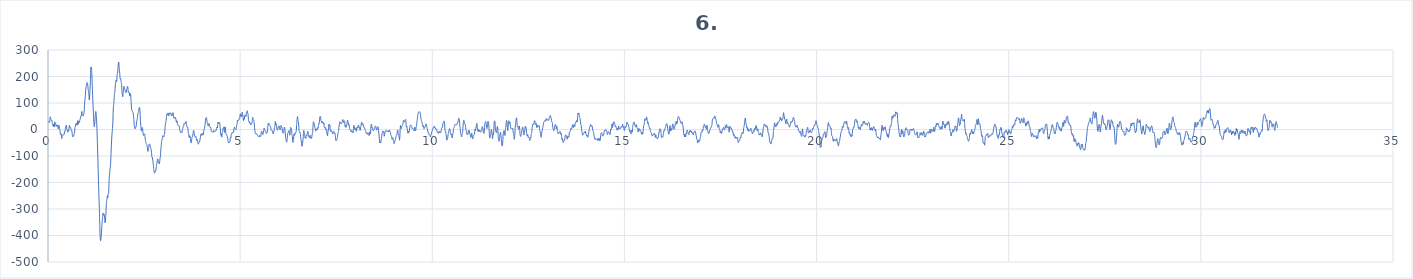
| Category | 6. kanál |
|---|---|
| 0.0 | 24.7 |
| 0.0078125 | 28.9 |
| 0.015625 | 31.4 |
| 0.0234375 | 27.4 |
| 0.03125 | 27.6 |
| 0.0390625 | 26.8 |
| 0.046875 | 31 |
| 0.0546875 | 44.9 |
| 0.0625 | 47.8 |
| 0.0703125 | 40.3 |
| 0.078125 | 37.4 |
| 0.0859375 | 34.8 |
| 0.09375 | 33.5 |
| 0.1015625 | 34.4 |
| 0.109375 | 26.9 |
| 0.1171875 | 18.6 |
| 0.125 | 17.2 |
| 0.1328125 | 12.1 |
| 0.140625 | 12.3 |
| 0.1484375 | 20.6 |
| 0.15625 | 14.6 |
| 0.1640625 | 9.6 |
| 0.171875 | 24.5 |
| 0.1796875 | 29 |
| 0.1875 | 21.6 |
| 0.1953125 | 23 |
| 0.203125 | 18.4 |
| 0.2109375 | 12.3 |
| 0.21875 | 17.4 |
| 0.2265625 | 16 |
| 0.234375 | 12 |
| 0.2421875 | 16.7 |
| 0.25 | 15.9 |
| 0.2578125 | 7.8 |
| 0.265625 | 2.4 |
| 0.2734375 | 6.6 |
| 0.28125 | 15.7 |
| 0.2890625 | 13.8 |
| 0.296875 | 5.8 |
| 0.3046875 | 2 |
| 0.3125 | -5.3 |
| 0.3203125 | -15.6 |
| 0.328125 | -20.4 |
| 0.3359375 | -17.6 |
| 0.34375 | -16.3 |
| 0.3515625 | -27.1 |
| 0.359375 | -33.7 |
| 0.3671875 | -26 |
| 0.375 | -21.8 |
| 0.3828125 | -21.9 |
| 0.390625 | -20.1 |
| 0.3984375 | -20.5 |
| 0.40625 | -19.9 |
| 0.4140625 | -20.1 |
| 0.421875 | -18.5 |
| 0.4296875 | -9 |
| 0.4375 | -6.4 |
| 0.4453125 | -7.1 |
| 0.453125 | 4.2 |
| 0.4609375 | 11.5 |
| 0.46875 | 12.5 |
| 0.4765625 | 16.5 |
| 0.484375 | 9.8 |
| 0.4921875 | -0.5 |
| 0.5 | -0.7 |
| 0.5078125 | -5.7 |
| 0.515625 | -10.5 |
| 0.5234375 | -3.7 |
| 0.53125 | -3.2 |
| 0.5390625 | -5.9 |
| 0.546875 | 5.3 |
| 0.5546875 | 15.7 |
| 0.5625 | 14.8 |
| 0.5703125 | 10.9 |
| 0.578125 | 7 |
| 0.5859375 | 6.7 |
| 0.59375 | 6.8 |
| 0.6015625 | -0.3 |
| 0.609375 | -5.4 |
| 0.6171875 | -4.6 |
| 0.625 | -9.1 |
| 0.6328125 | -19.4 |
| 0.640625 | -26.6 |
| 0.6484375 | -26.3 |
| 0.65625 | -24.3 |
| 0.6640625 | -25.9 |
| 0.671875 | -21.9 |
| 0.6796875 | -15.2 |
| 0.6875 | -14.1 |
| 0.6953125 | -4.9 |
| 0.703125 | 8.3 |
| 0.7109375 | 11.1 |
| 0.71875 | 16.6 |
| 0.7265625 | 22.5 |
| 0.734375 | 20 |
| 0.7421875 | 23.3 |
| 0.75 | 23.9 |
| 0.7578125 | 15.4 |
| 0.765625 | 22.3 |
| 0.7734375 | 33.6 |
| 0.78125 | 25.6 |
| 0.7890625 | 19.9 |
| 0.796875 | 28.8 |
| 0.8046875 | 31.7 |
| 0.8125 | 26.7 |
| 0.8203125 | 29.5 |
| 0.828125 | 36.5 |
| 0.8359375 | 38.7 |
| 0.84375 | 43.3 |
| 0.8515625 | 49.1 |
| 0.859375 | 48.6 |
| 0.8671875 | 53.1 |
| 0.875 | 65.6 |
| 0.8828125 | 67.6 |
| 0.890625 | 57.3 |
| 0.8984375 | 51.7 |
| 0.90625 | 52.4 |
| 0.9140625 | 51.3 |
| 0.921875 | 52.2 |
| 0.9296875 | 57.1 |
| 0.9375 | 62.9 |
| 0.9453125 | 78.7 |
| 0.953125 | 100.9 |
| 0.9609375 | 112.1 |
| 0.96875 | 120.2 |
| 0.9765625 | 137.4 |
| 0.984375 | 153.1 |
| 0.9921875 | 160.9 |
| 1.0 | 165.9 |
| 1.0078125 | 172 |
| 1.015625 | 177 |
| 1.0234375 | 176.1 |
| 1.03125 | 171.1 |
| 1.0390625 | 161.8 |
| 1.046875 | 149.6 |
| 1.0546875 | 143.8 |
| 1.0625 | 134.4 |
| 1.0703125 | 114.8 |
| 1.078125 | 111 |
| 1.0859375 | 129.7 |
| 1.09375 | 151.9 |
| 1.1015625 | 179.8 |
| 1.109375 | 215 |
| 1.1171875 | 236.2 |
| 1.125 | 235.4 |
| 1.1328125 | 226.7 |
| 1.140625 | 212 |
| 1.1484375 | 182.4 |
| 1.15625 | 147.2 |
| 1.1640625 | 119.2 |
| 1.171875 | 93.1 |
| 1.1796875 | 66.1 |
| 1.1875 | 42.6 |
| 1.1953125 | 21.9 |
| 1.203125 | 10.5 |
| 1.2109375 | 15 |
| 1.21875 | 28.4 |
| 1.2265625 | 44.6 |
| 1.234375 | 60.3 |
| 1.2421875 | 68.1 |
| 1.25 | 63.6 |
| 1.2578125 | 50.3 |
| 1.265625 | 31.6 |
| 1.2734375 | 3.4 |
| 1.28125 | -32.3 |
| 1.2890625 | -66.6 |
| 1.296875 | -104.2 |
| 1.3046875 | -148.6 |
| 1.3125 | -191.3 |
| 1.3203125 | -231.2 |
| 1.328125 | -266 |
| 1.3359375 | -297.1 |
| 1.34375 | -339.7 |
| 1.3515625 | -386.7 |
| 1.359375 | -412.9 |
| 1.3671875 | -419.6 |
| 1.375 | -417.6 |
| 1.3828125 | -406.4 |
| 1.390625 | -390.3 |
| 1.3984375 | -372.5 |
| 1.40625 | -354 |
| 1.4140625 | -342.4 |
| 1.421875 | -331.1 |
| 1.4296875 | -316.3 |
| 1.4375 | -316.2 |
| 1.4453125 | -323.5 |
| 1.453125 | -319.9 |
| 1.4609375 | -318.5 |
| 1.46875 | -325.4 |
| 1.4765625 | -337.2 |
| 1.484375 | -352.2 |
| 1.4921875 | -348.6 |
| 1.5 | -330.7 |
| 1.5078125 | -317.2 |
| 1.515625 | -292.4 |
| 1.5234375 | -270.4 |
| 1.53125 | -267.2 |
| 1.5390625 | -255.7 |
| 1.546875 | -249.7 |
| 1.5546875 | -258.1 |
| 1.5625 | -249.2 |
| 1.5703125 | -241.9 |
| 1.578125 | -241.7 |
| 1.5859375 | -213.2 |
| 1.59375 | -181.3 |
| 1.6015625 | -170.2 |
| 1.609375 | -157.3 |
| 1.6171875 | -144.7 |
| 1.625 | -137.2 |
| 1.6328125 | -119.3 |
| 1.640625 | -91.2 |
| 1.6484375 | -63.1 |
| 1.65625 | -39.6 |
| 1.6640625 | -19.7 |
| 1.671875 | -5.6 |
| 1.6796875 | 3.7 |
| 1.6875 | 27.7 |
| 1.6953125 | 64.9 |
| 1.703125 | 86.3 |
| 1.7109375 | 93.9 |
| 1.71875 | 110.9 |
| 1.7265625 | 130 |
| 1.734375 | 137.1 |
| 1.7421875 | 146.2 |
| 1.75 | 164.3 |
| 1.7578125 | 175.1 |
| 1.765625 | 180.9 |
| 1.7734375 | 186.3 |
| 1.78125 | 180.2 |
| 1.7890625 | 182.3 |
| 1.796875 | 203.5 |
| 1.8046875 | 212.1 |
| 1.8125 | 213.3 |
| 1.8203125 | 228.1 |
| 1.828125 | 243.6 |
| 1.8359375 | 254.6 |
| 1.84375 | 252.6 |
| 1.8515625 | 233.5 |
| 1.859375 | 221.8 |
| 1.8671875 | 211.4 |
| 1.875 | 192.4 |
| 1.8828125 | 189.8 |
| 1.890625 | 192.7 |
| 1.8984375 | 183.1 |
| 1.90625 | 177.4 |
| 1.9140625 | 169.1 |
| 1.921875 | 150.6 |
| 1.9296875 | 136.9 |
| 1.9375 | 127.3 |
| 1.9453125 | 123.5 |
| 1.953125 | 135 |
| 1.9609375 | 149.1 |
| 1.96875 | 157.6 |
| 1.9765625 | 162.8 |
| 1.984375 | 159.8 |
| 1.9921875 | 153.5 |
| 2.0 | 151.6 |
| 2.0078125 | 146.5 |
| 2.015625 | 140.3 |
| 2.0234375 | 139.5 |
| 2.03125 | 138.3 |
| 2.0390625 | 140.4 |
| 2.046875 | 149.9 |
| 2.0546875 | 156.2 |
| 2.0625 | 159.6 |
| 2.0703125 | 163.3 |
| 2.078125 | 158.4 |
| 2.0859375 | 147.4 |
| 2.09375 | 140.1 |
| 2.1015625 | 138.5 |
| 2.109375 | 140.8 |
| 2.1171875 | 138.9 |
| 2.125 | 129.4 |
| 2.1328125 | 126.3 |
| 2.140625 | 134.3 |
| 2.1484375 | 135 |
| 2.15625 | 119.9 |
| 2.1640625 | 101.2 |
| 2.171875 | 84.5 |
| 2.1796875 | 72.6 |
| 2.1875 | 70.4 |
| 2.1953125 | 69.9 |
| 2.203125 | 66.4 |
| 2.2109375 | 64.7 |
| 2.21875 | 58.8 |
| 2.2265625 | 48.4 |
| 2.234375 | 38.6 |
| 2.2421875 | 23 |
| 2.25 | 8.8 |
| 2.2578125 | 4.9 |
| 2.265625 | 2.7 |
| 2.2734375 | 3.9 |
| 2.28125 | 8.9 |
| 2.2890625 | 8.9 |
| 2.296875 | 14.4 |
| 2.3046875 | 27.8 |
| 2.3125 | 34 |
| 2.3203125 | 37.3 |
| 2.328125 | 46.1 |
| 2.3359375 | 55 |
| 2.34375 | 61.2 |
| 2.3515625 | 64.1 |
| 2.359375 | 68.5 |
| 2.3671875 | 78.6 |
| 2.375 | 83.8 |
| 2.3828125 | 82.3 |
| 2.390625 | 77.8 |
| 2.3984375 | 58 |
| 2.40625 | 29.7 |
| 2.4140625 | 14.9 |
| 2.421875 | 4.8 |
| 2.4296875 | -6.1 |
| 2.4375 | -3.2 |
| 2.4453125 | 6 |
| 2.453125 | 7.7 |
| 2.4609375 | 3.3 |
| 2.46875 | -7 |
| 2.4765625 | -18.2 |
| 2.484375 | -22.7 |
| 2.4921875 | -21.4 |
| 2.5 | -17.5 |
| 2.5078125 | -16.4 |
| 2.515625 | -19.8 |
| 2.5234375 | -26.3 |
| 2.53125 | -37.6 |
| 2.5390625 | -45.7 |
| 2.546875 | -48.3 |
| 2.5546875 | -52.9 |
| 2.5625 | -55.3 |
| 2.5703125 | -56.4 |
| 2.578125 | -61.9 |
| 2.5859375 | -68.9 |
| 2.59375 | -77.5 |
| 2.6015625 | -82.8 |
| 2.609375 | -79.3 |
| 2.6171875 | -72.3 |
| 2.625 | -62.4 |
| 2.6328125 | -55.2 |
| 2.640625 | -55.4 |
| 2.6484375 | -55.2 |
| 2.65625 | -59 |
| 2.6640625 | -65.8 |
| 2.671875 | -67.5 |
| 2.6796875 | -72.6 |
| 2.6875 | -81.1 |
| 2.6953125 | -90.7 |
| 2.703125 | -104 |
| 2.7109375 | -106.3 |
| 2.71875 | -105.6 |
| 2.7265625 | -117.9 |
| 2.734375 | -126.2 |
| 2.7421875 | -132.6 |
| 2.75 | -147 |
| 2.7578125 | -155.6 |
| 2.765625 | -161.1 |
| 2.7734375 | -164.7 |
| 2.78125 | -158.6 |
| 2.7890625 | -157.4 |
| 2.796875 | -159.8 |
| 2.8046875 | -154 |
| 2.8125 | -148.3 |
| 2.8203125 | -141.2 |
| 2.828125 | -130.9 |
| 2.8359375 | -125 |
| 2.84375 | -117.5 |
| 2.8515625 | -111 |
| 2.859375 | -113 |
| 2.8671875 | -119.2 |
| 2.875 | -125.7 |
| 2.8828125 | -126.7 |
| 2.890625 | -125.9 |
| 2.8984375 | -129.4 |
| 2.90625 | -122.2 |
| 2.9140625 | -109.8 |
| 2.921875 | -104.4 |
| 2.9296875 | -89.8 |
| 2.9375 | -72.1 |
| 2.9453125 | -63.4 |
| 2.953125 | -50.2 |
| 2.9609375 | -40.9 |
| 2.96875 | -39.4 |
| 2.9765625 | -30.1 |
| 2.984375 | -23.4 |
| 2.9921875 | -25 |
| 3.0 | -26.1 |
| 3.0078125 | -28.8 |
| 3.015625 | -26.4 |
| 3.0234375 | -20.2 |
| 3.03125 | -17.7 |
| 3.0390625 | -7.2 |
| 3.046875 | 8.4 |
| 3.0546875 | 17.8 |
| 3.0625 | 25.5 |
| 3.0703125 | 30.5 |
| 3.078125 | 39.7 |
| 3.0859375 | 55.8 |
| 3.09375 | 58.5 |
| 3.1015625 | 53.9 |
| 3.109375 | 58 |
| 3.1171875 | 61.3 |
| 3.125 | 62.8 |
| 3.1328125 | 60.6 |
| 3.140625 | 51.8 |
| 3.1484375 | 53.8 |
| 3.15625 | 61.1 |
| 3.1640625 | 60.2 |
| 3.171875 | 62.3 |
| 3.1796875 | 63.1 |
| 3.1875 | 59.4 |
| 3.1953125 | 62.1 |
| 3.203125 | 59.4 |
| 3.2109375 | 51.1 |
| 3.21875 | 53.2 |
| 3.2265625 | 55.1 |
| 3.234375 | 53.1 |
| 3.2421875 | 58.1 |
| 3.25 | 63.6 |
| 3.2578125 | 61.2 |
| 3.265625 | 52.2 |
| 3.2734375 | 43.7 |
| 3.28125 | 43.3 |
| 3.2890625 | 43.7 |
| 3.296875 | 41.6 |
| 3.3046875 | 44.1 |
| 3.3125 | 46.3 |
| 3.3203125 | 43.7 |
| 3.328125 | 38.7 |
| 3.3359375 | 30.5 |
| 3.34375 | 27.2 |
| 3.3515625 | 32.9 |
| 3.359375 | 32.1 |
| 3.3671875 | 22.1 |
| 3.375 | 16.9 |
| 3.3828125 | 17 |
| 3.390625 | 15.4 |
| 3.3984375 | 14.2 |
| 3.40625 | 15 |
| 3.4140625 | 12.8 |
| 3.421875 | 4.7 |
| 3.4296875 | -3.3 |
| 3.4375 | -6.9 |
| 3.4453125 | -9.8 |
| 3.453125 | -11.7 |
| 3.4609375 | -9.7 |
| 3.46875 | -8.4 |
| 3.4765625 | -11.3 |
| 3.484375 | -11.5 |
| 3.4921875 | -5.3 |
| 3.5 | 0.6 |
| 3.5078125 | 4 |
| 3.515625 | 9 |
| 3.5234375 | 12 |
| 3.53125 | 13.6 |
| 3.5390625 | 20.3 |
| 3.546875 | 24.6 |
| 3.5546875 | 22.4 |
| 3.5625 | 23 |
| 3.5703125 | 23.5 |
| 3.578125 | 22.6 |
| 3.5859375 | 28.5 |
| 3.59375 | 30.3 |
| 3.6015625 | 21.3 |
| 3.609375 | 15.2 |
| 3.6171875 | 11.2 |
| 3.625 | 6.8 |
| 3.6328125 | 8.2 |
| 3.640625 | 4.1 |
| 3.6484375 | -9.1 |
| 3.65625 | -15.7 |
| 3.6640625 | -19.9 |
| 3.671875 | -29.3 |
| 3.6796875 | -30.9 |
| 3.6875 | -24.6 |
| 3.6953125 | -23.5 |
| 3.703125 | -29.5 |
| 3.7109375 | -39.4 |
| 3.71875 | -48.8 |
| 3.7265625 | -50.8 |
| 3.734375 | -44.2 |
| 3.7421875 | -34.7 |
| 3.75 | -29.3 |
| 3.7578125 | -28.2 |
| 3.765625 | -24.7 |
| 3.7734375 | -16.2 |
| 3.78125 | -6.9 |
| 3.7890625 | -2.9 |
| 3.796875 | -6.9 |
| 3.8046875 | -14.2 |
| 3.8125 | -20.7 |
| 3.8203125 | -25.5 |
| 3.828125 | -28.1 |
| 3.8359375 | -29.3 |
| 3.84375 | -27.7 |
| 3.8515625 | -26.7 |
| 3.859375 | -34.6 |
| 3.8671875 | -41.6 |
| 3.875 | -37.2 |
| 3.8828125 | -36.7 |
| 3.890625 | -45.8 |
| 3.8984375 | -50 |
| 3.90625 | -51.5 |
| 3.9140625 | -55.5 |
| 3.921875 | -52 |
| 3.9296875 | -45.1 |
| 3.9375 | -46 |
| 3.9453125 | -46.5 |
| 3.953125 | -40.1 |
| 3.9609375 | -32.6 |
| 3.96875 | -25.9 |
| 3.9765625 | -19.1 |
| 3.984375 | -16.7 |
| 3.9921875 | -21.1 |
| 4.0 | -22.2 |
| 4.0078125 | -15.3 |
| 4.015625 | -14.3 |
| 4.0234375 | -19.8 |
| 4.03125 | -20.5 |
| 4.0390625 | -20.5 |
| 4.046875 | -17.2 |
| 4.0546875 | -4.8 |
| 4.0625 | 1.9 |
| 4.0703125 | 2.2 |
| 4.078125 | 9.5 |
| 4.0859375 | 18.5 |
| 4.09375 | 28.2 |
| 4.1015625 | 40.3 |
| 4.109375 | 43.9 |
| 4.1171875 | 44 |
| 4.125 | 44.6 |
| 4.1328125 | 36.2 |
| 4.140625 | 26.7 |
| 4.1484375 | 22.3 |
| 4.15625 | 16.1 |
| 4.1640625 | 13.2 |
| 4.171875 | 13.9 |
| 4.1796875 | 16.9 |
| 4.1875 | 23.1 |
| 4.1953125 | 19.6 |
| 4.203125 | 10.7 |
| 4.2109375 | 10.1 |
| 4.21875 | 8.7 |
| 4.2265625 | 7.3 |
| 4.234375 | 8.8 |
| 4.2421875 | 0.7 |
| 4.25 | -7.8 |
| 4.2578125 | -6.8 |
| 4.265625 | -8 |
| 4.2734375 | -10.2 |
| 4.28125 | -9.2 |
| 4.2890625 | -10.5 |
| 4.296875 | -10.4 |
| 4.3046875 | -5.7 |
| 4.3125 | -2.5 |
| 4.3203125 | -4.8 |
| 4.328125 | -7.8 |
| 4.3359375 | -7.7 |
| 4.34375 | -6.5 |
| 4.3515625 | -5.3 |
| 4.359375 | -6.1 |
| 4.3671875 | -6.5 |
| 4.375 | -2 |
| 4.3828125 | 3.1 |
| 4.390625 | 8 |
| 4.3984375 | 8.9 |
| 4.40625 | 5.5 |
| 4.4140625 | 15.2 |
| 4.421875 | 27.9 |
| 4.4296875 | 23.9 |
| 4.4375 | 23 |
| 4.4453125 | 28.2 |
| 4.453125 | 26.7 |
| 4.4609375 | 27.5 |
| 4.46875 | 23.2 |
| 4.4765625 | 11.6 |
| 4.484375 | 2.7 |
| 4.4921875 | -13.1 |
| 4.5 | -21.9 |
| 4.5078125 | -16.4 |
| 4.515625 | -24.3 |
| 4.5234375 | -28.8 |
| 4.53125 | -14.2 |
| 4.5390625 | -10.1 |
| 4.546875 | -8.1 |
| 4.5546875 | 4 |
| 4.5625 | 5.1 |
| 4.5703125 | 4.3 |
| 4.578125 | 9.9 |
| 4.5859375 | 2.4 |
| 4.59375 | -11 |
| 4.6015625 | -5.4 |
| 4.609375 | 10.1 |
| 4.6171875 | 5.8 |
| 4.625 | -12.4 |
| 4.6328125 | -18.5 |
| 4.640625 | -19 |
| 4.6484375 | -22.1 |
| 4.65625 | -22.4 |
| 4.6640625 | -26.8 |
| 4.671875 | -32.3 |
| 4.6796875 | -36.1 |
| 4.6875 | -46 |
| 4.6953125 | -49.8 |
| 4.703125 | -47.2 |
| 4.7109375 | -50.5 |
| 4.71875 | -49.3 |
| 4.7265625 | -46.6 |
| 4.734375 | -45.2 |
| 4.7421875 | -34.1 |
| 4.75 | -29.3 |
| 4.7578125 | -32.4 |
| 4.765625 | -23.1 |
| 4.7734375 | -16 |
| 4.78125 | -17.6 |
| 4.7890625 | -12.9 |
| 4.796875 | -10.6 |
| 4.8046875 | -12.7 |
| 4.8125 | -10.8 |
| 4.8203125 | -11.1 |
| 4.828125 | -9.6 |
| 4.8359375 | -0.4 |
| 4.84375 | 7.2 |
| 4.8515625 | 8.9 |
| 4.859375 | 6.9 |
| 4.8671875 | 2.9 |
| 4.875 | 0.3 |
| 4.8828125 | -0.9 |
| 4.890625 | -1.2 |
| 4.8984375 | 4.1 |
| 4.90625 | 12.9 |
| 4.9140625 | 16.9 |
| 4.921875 | 22.2 |
| 4.9296875 | 33 |
| 4.9375 | 35.8 |
| 4.9453125 | 33.2 |
| 4.953125 | 36.1 |
| 4.9609375 | 36 |
| 4.96875 | 36.2 |
| 4.9765625 | 42.3 |
| 4.984375 | 41.2 |
| 4.9921875 | 43.2 |
| 5.0 | 57.8 |
| 5.0078125 | 59.3 |
| 5.015625 | 50.2 |
| 5.0234375 | 52.8 |
| 5.03125 | 51.9 |
| 5.0390625 | 48.5 |
| 5.046875 | 60.1 |
| 5.0546875 | 65.5 |
| 5.0625 | 58.6 |
| 5.0703125 | 54.6 |
| 5.078125 | 42.4 |
| 5.0859375 | 33.4 |
| 5.09375 | 41 |
| 5.1015625 | 39.6 |
| 5.109375 | 38.2 |
| 5.1171875 | 51.7 |
| 5.125 | 55 |
| 5.1328125 | 52.2 |
| 5.140625 | 53.2 |
| 5.1484375 | 49.1 |
| 5.15625 | 54.9 |
| 5.1640625 | 64.2 |
| 5.171875 | 62.4 |
| 5.1796875 | 67.7 |
| 5.1875 | 70.7 |
| 5.1953125 | 62.1 |
| 5.203125 | 58.8 |
| 5.2109375 | 47.6 |
| 5.21875 | 30.9 |
| 5.2265625 | 31.7 |
| 5.234375 | 31.1 |
| 5.2421875 | 25.4 |
| 5.25 | 27.8 |
| 5.2578125 | 24.1 |
| 5.265625 | 19.2 |
| 5.2734375 | 22.5 |
| 5.28125 | 20.7 |
| 5.2890625 | 19.2 |
| 5.296875 | 23 |
| 5.3046875 | 23.7 |
| 5.3125 | 31 |
| 5.3203125 | 44.3 |
| 5.328125 | 45.3 |
| 5.3359375 | 38.7 |
| 5.34375 | 37.2 |
| 5.3515625 | 36.4 |
| 5.359375 | 30.5 |
| 5.3671875 | 19.8 |
| 5.375 | 7.3 |
| 5.3828125 | -3.5 |
| 5.390625 | -11.8 |
| 5.3984375 | -15.6 |
| 5.40625 | -13.5 |
| 5.4140625 | -13.5 |
| 5.421875 | -17.1 |
| 5.4296875 | -17.1 |
| 5.4375 | -16.7 |
| 5.4453125 | -19.5 |
| 5.453125 | -21.5 |
| 5.4609375 | -23.9 |
| 5.46875 | -25.6 |
| 5.4765625 | -24.7 |
| 5.484375 | -26.5 |
| 5.4921875 | -28.7 |
| 5.5 | -25.8 |
| 5.5078125 | -21.9 |
| 5.515625 | -22.8 |
| 5.5234375 | -26.1 |
| 5.53125 | -26.7 |
| 5.5390625 | -22.5 |
| 5.546875 | -13.7 |
| 5.5546875 | -6.6 |
| 5.5625 | -7.2 |
| 5.5703125 | -10 |
| 5.578125 | -13.1 |
| 5.5859375 | -18.8 |
| 5.59375 | -19.3 |
| 5.6015625 | -15 |
| 5.609375 | -9.9 |
| 5.6171875 | -0.2 |
| 5.625 | 5.4 |
| 5.6328125 | 1.5 |
| 5.640625 | 0 |
| 5.6484375 | -1 |
| 5.65625 | -5.3 |
| 5.6640625 | -7 |
| 5.671875 | -10.3 |
| 5.6796875 | -14.7 |
| 5.6875 | -12.8 |
| 5.6953125 | -10.7 |
| 5.703125 | -11.9 |
| 5.7109375 | -7 |
| 5.71875 | 6.9 |
| 5.7265625 | 20.9 |
| 5.734375 | 23.6 |
| 5.7421875 | 18.9 |
| 5.75 | 19.6 |
| 5.7578125 | 21.6 |
| 5.765625 | 17.5 |
| 5.7734375 | 14.7 |
| 5.78125 | 14 |
| 5.7890625 | 11 |
| 5.796875 | 6.9 |
| 5.8046875 | 0.8 |
| 5.8125 | -2.8 |
| 5.8203125 | -1.5 |
| 5.828125 | -4.4 |
| 5.8359375 | -6.9 |
| 5.84375 | -6.6 |
| 5.8515625 | -14 |
| 5.859375 | -16.6 |
| 5.8671875 | -9.5 |
| 5.875 | -9.6 |
| 5.8828125 | -5.3 |
| 5.890625 | 6.7 |
| 5.8984375 | 7.9 |
| 5.90625 | 15.4 |
| 5.9140625 | 30.3 |
| 5.921875 | 24.2 |
| 5.9296875 | 16.6 |
| 5.9375 | 21.9 |
| 5.9453125 | 14.3 |
| 5.953125 | 1.2 |
| 5.9609375 | -0.5 |
| 5.96875 | -2 |
| 5.9765625 | -2.3 |
| 5.984375 | 5.4 |
| 5.9921875 | 11.4 |
| 6.0 | 11.8 |
| 6.0078125 | 13.3 |
| 6.015625 | 12.8 |
| 6.0234375 | 5 |
| 6.03125 | 0.9 |
| 6.0390625 | 1.5 |
| 6.046875 | -1.6 |
| 6.0546875 | 3.8 |
| 6.0625 | 15.4 |
| 6.0703125 | 13.9 |
| 6.078125 | 9.7 |
| 6.0859375 | 9.4 |
| 6.09375 | 2.9 |
| 6.1015625 | -5.5 |
| 6.109375 | -11.8 |
| 6.1171875 | -14.2 |
| 6.125 | -11.7 |
| 6.1328125 | -9.6 |
| 6.140625 | -1.7 |
| 6.1484375 | 8.7 |
| 6.15625 | 7.5 |
| 6.1640625 | 1.1 |
| 6.171875 | -8.9 |
| 6.1796875 | -25 |
| 6.1875 | -34.2 |
| 6.1953125 | -38.9 |
| 6.203125 | -45.9 |
| 6.2109375 | -47.5 |
| 6.21875 | -42.9 |
| 6.2265625 | -31.4 |
| 6.234375 | -17.6 |
| 6.2421875 | -13.4 |
| 6.25 | -11.4 |
| 6.2578125 | -5.5 |
| 6.265625 | -4.8 |
| 6.2734375 | -7.5 |
| 6.28125 | -13 |
| 6.2890625 | -21.8 |
| 6.296875 | -18.1 |
| 6.3046875 | -1 |
| 6.3125 | 8 |
| 6.3203125 | 6 |
| 6.328125 | 5.6 |
| 6.3359375 | 0.3 |
| 6.34375 | -14.5 |
| 6.3515625 | -23 |
| 6.359375 | -28.7 |
| 6.3671875 | -43 |
| 6.375 | -48.6 |
| 6.3828125 | -41 |
| 6.390625 | -32.1 |
| 6.3984375 | -20.3 |
| 6.40625 | -17.1 |
| 6.4140625 | -22.5 |
| 6.421875 | -16.8 |
| 6.4296875 | -13.1 |
| 6.4375 | -16.6 |
| 6.4453125 | -12.3 |
| 6.453125 | -10 |
| 6.4609375 | -4.4 |
| 6.46875 | 15.9 |
| 6.4765625 | 30.5 |
| 6.484375 | 39.2 |
| 6.4921875 | 49 |
| 6.5 | 42.8 |
| 6.5078125 | 31.4 |
| 6.515625 | 29.4 |
| 6.5234375 | 17.6 |
| 6.53125 | -1.4 |
| 6.5390625 | -8 |
| 6.546875 | -10.6 |
| 6.5546875 | -13 |
| 6.5625 | -12 |
| 6.5703125 | -20.5 |
| 6.578125 | -33.9 |
| 6.5859375 | -39.4 |
| 6.59375 | -47.7 |
| 6.6015625 | -58.5 |
| 6.609375 | -63.2 |
| 6.6171875 | -61.7 |
| 6.625 | -51.5 |
| 6.6328125 | -42 |
| 6.640625 | -31.5 |
| 6.6484375 | -10.8 |
| 6.65625 | -3.9 |
| 6.6640625 | -11 |
| 6.671875 | -11.6 |
| 6.6796875 | -20.1 |
| 6.6875 | -31.5 |
| 6.6953125 | -30.9 |
| 6.703125 | -33.9 |
| 6.7109375 | -33.1 |
| 6.71875 | -22.6 |
| 6.7265625 | -22.3 |
| 6.734375 | -23.8 |
| 6.7421875 | -17.6 |
| 6.75 | -12.5 |
| 6.7578125 | -7.4 |
| 6.765625 | -8.5 |
| 6.7734375 | -20 |
| 6.78125 | -26.5 |
| 6.7890625 | -26.5 |
| 6.796875 | -29.7 |
| 6.8046875 | -30.7 |
| 6.8125 | -25.1 |
| 6.8203125 | -21.6 |
| 6.828125 | -27.6 |
| 6.8359375 | -33.4 |
| 6.84375 | -29.4 |
| 6.8515625 | -28.2 |
| 6.859375 | -32.9 |
| 6.8671875 | -26 |
| 6.875 | -15.9 |
| 6.8828125 | -14.8 |
| 6.890625 | -4.4 |
| 6.8984375 | 17 |
| 6.90625 | 28.9 |
| 6.9140625 | 28 |
| 6.921875 | 23.5 |
| 6.9296875 | 21.5 |
| 6.9375 | 17.1 |
| 6.9453125 | 8.5 |
| 6.953125 | 3.8 |
| 6.9609375 | -2.2 |
| 6.96875 | -6.3 |
| 6.9765625 | 0.2 |
| 6.984375 | 1.2 |
| 6.9921875 | -0.8 |
| 7.0 | 3.7 |
| 7.0078125 | 0.4 |
| 7.015625 | 0.5 |
| 7.0234375 | 8.3 |
| 7.03125 | 6.2 |
| 7.0390625 | 11.9 |
| 7.046875 | 24.1 |
| 7.0546875 | 22.5 |
| 7.0625 | 29.1 |
| 7.0703125 | 43.8 |
| 7.078125 | 47.5 |
| 7.0859375 | 50.4 |
| 7.09375 | 46.1 |
| 7.1015625 | 34.8 |
| 7.109375 | 31.9 |
| 7.1171875 | 27.2 |
| 7.125 | 25 |
| 7.1328125 | 29.9 |
| 7.140625 | 26 |
| 7.1484375 | 25.8 |
| 7.15625 | 28.4 |
| 7.1640625 | 21.2 |
| 7.171875 | 23.9 |
| 7.1796875 | 24.8 |
| 7.1875 | 10.4 |
| 7.1953125 | 8.1 |
| 7.203125 | 9.5 |
| 7.2109375 | 4.5 |
| 7.21875 | 6.8 |
| 7.2265625 | 3.1 |
| 7.234375 | -1.8 |
| 7.2421875 | 0.2 |
| 7.25 | -9.2 |
| 7.2578125 | -16.1 |
| 7.265625 | -17.1 |
| 7.2734375 | -23.8 |
| 7.28125 | -13.7 |
| 7.2890625 | -0.9 |
| 7.296875 | -2.8 |
| 7.3046875 | 9.8 |
| 7.3125 | 20.3 |
| 7.3203125 | 13 |
| 7.328125 | 17.2 |
| 7.3359375 | 16 |
| 7.34375 | -1.9 |
| 7.3515625 | -6.7 |
| 7.359375 | -4.7 |
| 7.3671875 | -6.5 |
| 7.375 | -4 |
| 7.3828125 | -6.1 |
| 7.390625 | -9.9 |
| 7.3984375 | -10.5 |
| 7.40625 | -16.3 |
| 7.4140625 | -16.5 |
| 7.421875 | -8.5 |
| 7.4296875 | -7.7 |
| 7.4375 | -9 |
| 7.4453125 | -8.2 |
| 7.453125 | -12.6 |
| 7.4609375 | -15.4 |
| 7.46875 | -14.6 |
| 7.4765625 | -23.4 |
| 7.484375 | -37.8 |
| 7.4921875 | -41.3 |
| 7.5 | -38.8 |
| 7.5078125 | -40.8 |
| 7.515625 | -39.8 |
| 7.5234375 | -34.2 |
| 7.53125 | -29.8 |
| 7.5390625 | -20.9 |
| 7.546875 | -11.5 |
| 7.5546875 | -10.4 |
| 7.5625 | -4.7 |
| 7.5703125 | 8.6 |
| 7.578125 | 16.5 |
| 7.5859375 | 23.6 |
| 7.59375 | 29.2 |
| 7.6015625 | 26.1 |
| 7.609375 | 24.8 |
| 7.6171875 | 25.6 |
| 7.625 | 21.1 |
| 7.6328125 | 21.2 |
| 7.640625 | 25.3 |
| 7.6484375 | 25.8 |
| 7.65625 | 28.8 |
| 7.6640625 | 34.7 |
| 7.671875 | 37.8 |
| 7.6796875 | 35.3 |
| 7.6875 | 28.5 |
| 7.6953125 | 25.8 |
| 7.703125 | 28.8 |
| 7.7109375 | 32.7 |
| 7.71875 | 30.6 |
| 7.7265625 | 17 |
| 7.734375 | 10.2 |
| 7.7421875 | 15.1 |
| 7.75 | 10.3 |
| 7.7578125 | 8.1 |
| 7.765625 | 16.2 |
| 7.7734375 | 16 |
| 7.78125 | 21.1 |
| 7.7890625 | 34.4 |
| 7.796875 | 34.8 |
| 7.8046875 | 30.7 |
| 7.8125 | 25.1 |
| 7.8203125 | 16.5 |
| 7.828125 | 18.4 |
| 7.8359375 | 18.8 |
| 7.84375 | 8.8 |
| 7.8515625 | 2.8 |
| 7.859375 | -0.6 |
| 7.8671875 | -3.3 |
| 7.875 | -3.3 |
| 7.8828125 | -7.1 |
| 7.890625 | -9.6 |
| 7.8984375 | -5 |
| 7.90625 | -3.7 |
| 7.9140625 | -9 |
| 7.921875 | -11.8 |
| 7.9296875 | -12 |
| 7.9375 | -12.7 |
| 7.9453125 | -4 |
| 7.953125 | 11.5 |
| 7.9609375 | 16.1 |
| 7.96875 | 12.9 |
| 7.9765625 | 9.7 |
| 7.984375 | 2.1 |
| 7.9921875 | -2.4 |
| 8.0 | 2.2 |
| 8.0078125 | 5.9 |
| 8.015625 | 1.4 |
| 8.0234375 | -6.5 |
| 8.03125 | -4.6 |
| 8.0390625 | 6.6 |
| 8.046875 | 10.3 |
| 8.0546875 | 6.7 |
| 8.0625 | 6 |
| 8.0703125 | 9.7 |
| 8.078125 | 16.2 |
| 8.0859375 | 15.5 |
| 8.09375 | 6.8 |
| 8.1015625 | 6.2 |
| 8.109375 | 6.9 |
| 8.1171875 | -2 |
| 8.125 | -2.8 |
| 8.1328125 | 6.9 |
| 8.140625 | 11.2 |
| 8.1484375 | 16.1 |
| 8.15625 | 25.5 |
| 8.1640625 | 28 |
| 8.171875 | 22.6 |
| 8.1796875 | 18.1 |
| 8.1875 | 19.4 |
| 8.1953125 | 21.4 |
| 8.203125 | 16.9 |
| 8.2109375 | 10.4 |
| 8.21875 | 7.8 |
| 8.2265625 | 7.5 |
| 8.234375 | 7.2 |
| 8.2421875 | 3.9 |
| 8.25 | -1.3 |
| 8.2578125 | -2.9 |
| 8.265625 | -4.7 |
| 8.2734375 | -10.4 |
| 8.28125 | -14.4 |
| 8.2890625 | -13.8 |
| 8.296875 | -12.7 |
| 8.3046875 | -15.5 |
| 8.3125 | -18.3 |
| 8.3203125 | -14.2 |
| 8.328125 | -12 |
| 8.3359375 | -17.4 |
| 8.34375 | -18.5 |
| 8.3515625 | -18.6 |
| 8.359375 | -23.1 |
| 8.3671875 | -17 |
| 8.375 | -8.6 |
| 8.3828125 | -15.3 |
| 8.390625 | -16.9 |
| 8.3984375 | -1.6 |
| 8.40625 | 13.6 |
| 8.4140625 | 20.5 |
| 8.421875 | 16.1 |
| 8.4296875 | 6.6 |
| 8.4375 | 5.9 |
| 8.4453125 | 7.6 |
| 8.453125 | 1 |
| 8.4609375 | -5.1 |
| 8.46875 | -3.8 |
| 8.4765625 | -0.9 |
| 8.484375 | -0.4 |
| 8.4921875 | 0.3 |
| 8.5 | 3.9 |
| 8.5078125 | 9.2 |
| 8.515625 | 12.7 |
| 8.5234375 | 12.8 |
| 8.53125 | 11.5 |
| 8.5390625 | 6.2 |
| 8.546875 | -1.8 |
| 8.5546875 | -2.3 |
| 8.5625 | 1.1 |
| 8.5703125 | 2.5 |
| 8.578125 | 7 |
| 8.5859375 | 10.5 |
| 8.59375 | 6.3 |
| 8.6015625 | -3.5 |
| 8.609375 | -15.1 |
| 8.6171875 | -25.5 |
| 8.625 | -39.4 |
| 8.6328125 | -50.5 |
| 8.640625 | -46.7 |
| 8.6484375 | -45.2 |
| 8.65625 | -50.7 |
| 8.6640625 | -44.5 |
| 8.671875 | -36.6 |
| 8.6796875 | -32 |
| 8.6875 | -20.1 |
| 8.6953125 | -13.7 |
| 8.703125 | -12.3 |
| 8.7109375 | -6.1 |
| 8.71875 | -6.8 |
| 8.7265625 | -8.8 |
| 8.734375 | -6.9 |
| 8.7421875 | -16.1 |
| 8.75 | -25.3 |
| 8.7578125 | -20.7 |
| 8.765625 | -13.9 |
| 8.7734375 | -9.2 |
| 8.78125 | -5.5 |
| 8.7890625 | -5.7 |
| 8.796875 | -5.6 |
| 8.8046875 | -3.6 |
| 8.8125 | -3.2 |
| 8.8203125 | -6.1 |
| 8.828125 | -8.6 |
| 8.8359375 | -6.8 |
| 8.84375 | -5.1 |
| 8.8515625 | -5.1 |
| 8.859375 | -5.5 |
| 8.8671875 | -9.4 |
| 8.875 | -9 |
| 8.8828125 | -2.8 |
| 8.890625 | -3.6 |
| 8.8984375 | -8.5 |
| 8.90625 | -9.8 |
| 8.9140625 | -13.4 |
| 8.921875 | -20 |
| 8.9296875 | -23.7 |
| 8.9375 | -24.5 |
| 8.9453125 | -29.3 |
| 8.953125 | -37.1 |
| 8.9609375 | -35 |
| 8.96875 | -30.4 |
| 8.9765625 | -35.9 |
| 8.984375 | -39.3 |
| 8.9921875 | -41 |
| 9.0 | -50.1 |
| 9.0078125 | -53.5 |
| 9.015625 | -49 |
| 9.0234375 | -46 |
| 9.03125 | -41.5 |
| 9.0390625 | -36.9 |
| 9.046875 | -33 |
| 9.0546875 | -26.8 |
| 9.0625 | -23 |
| 9.0703125 | -21.3 |
| 9.078125 | -18.9 |
| 9.0859375 | -14 |
| 9.09375 | -4.3 |
| 9.1015625 | -2 |
| 9.109375 | -12.3 |
| 9.1171875 | -20.1 |
| 9.125 | -21.5 |
| 9.1328125 | -24.1 |
| 9.140625 | -32.5 |
| 9.1484375 | -40.4 |
| 9.15625 | -27.8 |
| 9.1640625 | 0.6 |
| 9.171875 | 15.3 |
| 9.1796875 | 11 |
| 9.1875 | 3.5 |
| 9.1953125 | 4.9 |
| 9.203125 | 11.3 |
| 9.2109375 | 11.7 |
| 9.21875 | 13.5 |
| 9.2265625 | 18.7 |
| 9.234375 | 20.1 |
| 9.2421875 | 27.4 |
| 9.25 | 34.8 |
| 9.2578125 | 30.7 |
| 9.265625 | 28.2 |
| 9.2734375 | 28.8 |
| 9.28125 | 29 |
| 9.2890625 | 33.9 |
| 9.296875 | 37.2 |
| 9.3046875 | 38.2 |
| 9.3125 | 32.6 |
| 9.3203125 | 15.5 |
| 9.328125 | 9.2 |
| 9.3359375 | 13.5 |
| 9.34375 | 7.7 |
| 9.3515625 | -1.8 |
| 9.359375 | -10 |
| 9.3671875 | -14.4 |
| 9.375 | -8.1 |
| 9.3828125 | -5.5 |
| 9.390625 | -11.1 |
| 9.3984375 | -10.6 |
| 9.40625 | -3.4 |
| 9.4140625 | 6.3 |
| 9.421875 | 14.5 |
| 9.4296875 | 17.1 |
| 9.4375 | 17 |
| 9.4453125 | 16 |
| 9.453125 | 15.1 |
| 9.4609375 | 13.5 |
| 9.46875 | 7.9 |
| 9.4765625 | 3.8 |
| 9.484375 | 4.9 |
| 9.4921875 | 4.3 |
| 9.5 | 1.8 |
| 9.5078125 | 2.1 |
| 9.515625 | 0 |
| 9.5234375 | -5.2 |
| 9.53125 | -3.5 |
| 9.5390625 | 5 |
| 9.546875 | 9 |
| 9.5546875 | 3.1 |
| 9.5625 | -5.2 |
| 9.5703125 | -2.1 |
| 9.578125 | 7.4 |
| 9.5859375 | 12.1 |
| 9.59375 | 20.1 |
| 9.6015625 | 30.6 |
| 9.609375 | 37.6 |
| 9.6171875 | 47.9 |
| 9.625 | 56.4 |
| 9.6328125 | 59.8 |
| 9.640625 | 64.8 |
| 9.6484375 | 65.4 |
| 9.65625 | 64.9 |
| 9.6640625 | 67.4 |
| 9.671875 | 65.7 |
| 9.6796875 | 64.9 |
| 9.6875 | 62.4 |
| 9.6953125 | 52.4 |
| 9.703125 | 44.7 |
| 9.7109375 | 37.9 |
| 9.71875 | 32.4 |
| 9.7265625 | 31.6 |
| 9.734375 | 25.1 |
| 9.7421875 | 18 |
| 9.75 | 14.4 |
| 9.7578125 | 9.5 |
| 9.765625 | 13.1 |
| 9.7734375 | 14.3 |
| 9.78125 | 3.9 |
| 9.7890625 | 3.3 |
| 9.796875 | 8.1 |
| 9.8046875 | 7.8 |
| 9.8125 | 10.4 |
| 9.8203125 | 10.9 |
| 9.828125 | 13.9 |
| 9.8359375 | 21.3 |
| 9.84375 | 18.6 |
| 9.8515625 | 13.4 |
| 9.859375 | 10.1 |
| 9.8671875 | 3 |
| 9.875 | -1.5 |
| 9.8828125 | -6.5 |
| 9.890625 | -10.2 |
| 9.8984375 | -8.7 |
| 9.90625 | -13.9 |
| 9.9140625 | -19.2 |
| 9.921875 | -18.7 |
| 9.9296875 | -20.7 |
| 9.9375 | -21.5 |
| 9.9453125 | -24.6 |
| 9.953125 | -28 |
| 9.9609375 | -21.9 |
| 9.96875 | -19.5 |
| 9.9765625 | -18.4 |
| 9.984375 | -9.1 |
| 9.9921875 | -6.4 |
| 10.0 | -6.4 |
| 10.0078125 | 0 |
| 10.015625 | 3.8 |
| 10.0234375 | 6.4 |
| 10.03125 | 7 |
| 10.0390625 | 5.5 |
| 10.046875 | 10.6 |
| 10.0546875 | 13.4 |
| 10.0625 | 7.9 |
| 10.0703125 | 5.2 |
| 10.078125 | 5.2 |
| 10.0859375 | 2.7 |
| 10.09375 | 0.9 |
| 10.1015625 | 2.1 |
| 10.109375 | 2.4 |
| 10.1171875 | -2.3 |
| 10.125 | -8.7 |
| 10.1328125 | -10.8 |
| 10.140625 | -10.4 |
| 10.1484375 | -12.1 |
| 10.15625 | -15 |
| 10.1640625 | -13.2 |
| 10.171875 | -7.6 |
| 10.1796875 | -6.5 |
| 10.1875 | -10.5 |
| 10.1953125 | -11.7 |
| 10.203125 | -9.2 |
| 10.2109375 | -10.1 |
| 10.21875 | -12.8 |
| 10.2265625 | -8.3 |
| 10.234375 | -0.3 |
| 10.2421875 | 4.7 |
| 10.25 | 7.7 |
| 10.2578125 | 7.4 |
| 10.265625 | 9 |
| 10.2734375 | 17.5 |
| 10.28125 | 24.4 |
| 10.2890625 | 26.8 |
| 10.296875 | 28.3 |
| 10.3046875 | 30.5 |
| 10.3125 | 31.9 |
| 10.3203125 | 21.5 |
| 10.328125 | 2.3 |
| 10.3359375 | -6.3 |
| 10.34375 | -5.9 |
| 10.3515625 | -9.6 |
| 10.359375 | -18.5 |
| 10.3671875 | -30.7 |
| 10.375 | -39.5 |
| 10.3828125 | -39.6 |
| 10.390625 | -37.4 |
| 10.3984375 | -33.8 |
| 10.40625 | -24 |
| 10.4140625 | -16.4 |
| 10.421875 | -15 |
| 10.4296875 | -9.4 |
| 10.4375 | -1.3 |
| 10.4453125 | 2.4 |
| 10.453125 | 3.5 |
| 10.4609375 | -1.3 |
| 10.46875 | -9 |
| 10.4765625 | -12.6 |
| 10.484375 | -18.1 |
| 10.4921875 | -21 |
| 10.5 | -17.2 |
| 10.5078125 | -22.5 |
| 10.515625 | -32 |
| 10.5234375 | -28.1 |
| 10.53125 | -19.6 |
| 10.5390625 | -14.6 |
| 10.546875 | -5.9 |
| 10.5546875 | 3.3 |
| 10.5625 | 6 |
| 10.5703125 | 7.9 |
| 10.578125 | 13.1 |
| 10.5859375 | 16.8 |
| 10.59375 | 18.8 |
| 10.6015625 | 20.8 |
| 10.609375 | 20 |
| 10.6171875 | 18.4 |
| 10.625 | 18 |
| 10.6328125 | 16.7 |
| 10.640625 | 18.9 |
| 10.6484375 | 24.5 |
| 10.65625 | 25.8 |
| 10.6640625 | 25.4 |
| 10.671875 | 31 |
| 10.6796875 | 39.1 |
| 10.6875 | 41.8 |
| 10.6953125 | 41.9 |
| 10.703125 | 38.3 |
| 10.7109375 | 25.1 |
| 10.71875 | 12.5 |
| 10.7265625 | 3.8 |
| 10.734375 | -10 |
| 10.7421875 | -17.7 |
| 10.75 | -18.2 |
| 10.7578125 | -26.1 |
| 10.765625 | -27.4 |
| 10.7734375 | -18.1 |
| 10.78125 | -15.6 |
| 10.7890625 | -11 |
| 10.796875 | 4.5 |
| 10.8046875 | 20.1 |
| 10.8125 | 31.2 |
| 10.8203125 | 34.9 |
| 10.828125 | 31.6 |
| 10.8359375 | 26.4 |
| 10.84375 | 22 |
| 10.8515625 | 21.2 |
| 10.859375 | 17.5 |
| 10.8671875 | 6.4 |
| 10.875 | -1.6 |
| 10.8828125 | -3.4 |
| 10.890625 | -6 |
| 10.8984375 | -13 |
| 10.90625 | -19.8 |
| 10.9140625 | -19 |
| 10.921875 | -18 |
| 10.9296875 | -18 |
| 10.9375 | -9.2 |
| 10.9453125 | -3 |
| 10.953125 | -4.4 |
| 10.9609375 | -3.7 |
| 10.96875 | -8.5 |
| 10.9765625 | -17.3 |
| 10.984375 | -18.4 |
| 10.9921875 | -21.4 |
| 11.0 | -29.3 |
| 11.0078125 | -28.8 |
| 11.015625 | -19.7 |
| 11.0234375 | -13.9 |
| 11.03125 | -17.2 |
| 11.0390625 | -25.7 |
| 11.046875 | -34.1 |
| 11.0546875 | -35.2 |
| 11.0625 | -27.9 |
| 11.0703125 | -23.4 |
| 11.078125 | -22.6 |
| 11.0859375 | -20.2 |
| 11.09375 | -19.5 |
| 11.1015625 | -12.4 |
| 11.109375 | 1.1 |
| 11.1171875 | 1.4 |
| 11.125 | -3.9 |
| 11.1328125 | 2.1 |
| 11.140625 | 9.4 |
| 11.1484375 | 16 |
| 11.15625 | 23.7 |
| 11.1640625 | 19.1 |
| 11.171875 | 8.3 |
| 11.1796875 | 2.3 |
| 11.1875 | -5.8 |
| 11.1953125 | -7.5 |
| 11.203125 | -0.4 |
| 11.2109375 | -3.6 |
| 11.21875 | -7.6 |
| 11.2265625 | -1.9 |
| 11.234375 | -3.5 |
| 11.2421875 | -8.2 |
| 11.25 | -7.8 |
| 11.2578125 | -10 |
| 11.265625 | -8.7 |
| 11.2734375 | -5.3 |
| 11.28125 | -5 |
| 11.2890625 | 3.4 |
| 11.296875 | 10.8 |
| 11.3046875 | 8.6 |
| 11.3125 | 7.9 |
| 11.3203125 | 1 |
| 11.328125 | -10.3 |
| 11.3359375 | -12.5 |
| 11.34375 | -15.2 |
| 11.3515625 | -11.7 |
| 11.359375 | 7.1 |
| 11.3671875 | 20.2 |
| 11.375 | 25.4 |
| 11.3828125 | 30.2 |
| 11.390625 | 29.2 |
| 11.3984375 | 26.6 |
| 11.40625 | 19.1 |
| 11.4140625 | 5.9 |
| 11.421875 | 3.6 |
| 11.4296875 | 10.2 |
| 11.4375 | 18.2 |
| 11.4453125 | 28.3 |
| 11.453125 | 31 |
| 11.4609375 | 26.9 |
| 11.46875 | 20.8 |
| 11.4765625 | 4.5 |
| 11.484375 | -16.4 |
| 11.4921875 | -30 |
| 11.5 | -32 |
| 11.5078125 | -23.7 |
| 11.515625 | -19.5 |
| 11.5234375 | -17.8 |
| 11.53125 | -5.6 |
| 11.5390625 | 0.8 |
| 11.546875 | -5.9 |
| 11.5546875 | -13.4 |
| 11.5625 | -26.8 |
| 11.5703125 | -34.1 |
| 11.578125 | -22 |
| 11.5859375 | -17.8 |
| 11.59375 | -19.9 |
| 11.6015625 | 0.4 |
| 11.609375 | 24.4 |
| 11.6171875 | 31.3 |
| 11.625 | 32.5 |
| 11.6328125 | 24.9 |
| 11.640625 | 6 |
| 11.6484375 | -5.2 |
| 11.65625 | -6.5 |
| 11.6640625 | -11 |
| 11.671875 | -12.1 |
| 11.6796875 | -1.6 |
| 11.6875 | 8.5 |
| 11.6953125 | 11.8 |
| 11.703125 | 5.9 |
| 11.7109375 | -13.4 |
| 11.71875 | -31 |
| 11.7265625 | -38.2 |
| 11.734375 | -44.2 |
| 11.7421875 | -42.8 |
| 11.75 | -33.7 |
| 11.7578125 | -25.9 |
| 11.765625 | -15.7 |
| 11.7734375 | -10.4 |
| 11.78125 | -16.3 |
| 11.7890625 | -23.9 |
| 11.796875 | -36.7 |
| 11.8046875 | -53.1 |
| 11.8125 | -60.7 |
| 11.8203125 | -62.9 |
| 11.828125 | -59.1 |
| 11.8359375 | -42.2 |
| 11.84375 | -20.8 |
| 11.8515625 | -7.8 |
| 11.859375 | -5.5 |
| 11.8671875 | -5.2 |
| 11.875 | -5.6 |
| 11.8828125 | -15.9 |
| 11.890625 | -22.6 |
| 11.8984375 | -10.2 |
| 11.90625 | 3.2 |
| 11.9140625 | 9 |
| 11.921875 | 20.4 |
| 11.9296875 | 32.2 |
| 11.9375 | 33.5 |
| 11.9453125 | 26 |
| 11.953125 | 10.4 |
| 11.9609375 | -4.3 |
| 11.96875 | -2.7 |
| 11.9765625 | 11.6 |
| 11.984375 | 26 |
| 11.9921875 | 33.1 |
| 12.0 | 29 |
| 12.0078125 | 22.4 |
| 12.015625 | 24.7 |
| 12.0234375 | 26.9 |
| 12.03125 | 17.7 |
| 12.0390625 | 6.6 |
| 12.046875 | 4.8 |
| 12.0546875 | 5.9 |
| 12.0625 | 4 |
| 12.0703125 | 2.2 |
| 12.078125 | 1.8 |
| 12.0859375 | 4.2 |
| 12.09375 | 4.6 |
| 12.1015625 | -4.9 |
| 12.109375 | -14.3 |
| 12.1171875 | -17.6 |
| 12.125 | -26.9 |
| 12.1328125 | -36.9 |
| 12.140625 | -32.8 |
| 12.1484375 | -17.2 |
| 12.15625 | 2.7 |
| 12.1640625 | 18.8 |
| 12.171875 | 26.4 |
| 12.1796875 | 33.7 |
| 12.1875 | 43.3 |
| 12.1953125 | 43.9 |
| 12.203125 | 29.4 |
| 12.2109375 | 12.6 |
| 12.21875 | 10 |
| 12.2265625 | 12.9 |
| 12.234375 | 8.1 |
| 12.2421875 | 2.1 |
| 12.25 | 0.2 |
| 12.2578125 | 5.7 |
| 12.265625 | 13.5 |
| 12.2734375 | 4.3 |
| 12.28125 | -14.3 |
| 12.2890625 | -22.5 |
| 12.296875 | -25.4 |
| 12.3046875 | -25.7 |
| 12.3125 | -19.4 |
| 12.3203125 | -12.2 |
| 12.328125 | -6.3 |
| 12.3359375 | -0.9 |
| 12.34375 | 5.8 |
| 12.3515625 | 10 |
| 12.359375 | 4.6 |
| 12.3671875 | -3.7 |
| 12.375 | -12.4 |
| 12.3828125 | -21 |
| 12.390625 | -18 |
| 12.3984375 | -10.9 |
| 12.40625 | -5.8 |
| 12.4140625 | 6 |
| 12.421875 | 12.4 |
| 12.4296875 | 10 |
| 12.4375 | 10 |
| 12.4453125 | 2.6 |
| 12.453125 | -10.8 |
| 12.4609375 | -19 |
| 12.46875 | -24.3 |
| 12.4765625 | -21.2 |
| 12.484375 | -18.7 |
| 12.4921875 | -27.9 |
| 12.5 | -31.2 |
| 12.5078125 | -28 |
| 12.515625 | -30.5 |
| 12.5234375 | -31.8 |
| 12.53125 | -35.2 |
| 12.5390625 | -41.1 |
| 12.546875 | -38.7 |
| 12.5546875 | -36.3 |
| 12.5625 | -32.8 |
| 12.5703125 | -21.7 |
| 12.578125 | -15.9 |
| 12.5859375 | -12 |
| 12.59375 | -0.5 |
| 12.6015625 | 8.6 |
| 12.609375 | 15.6 |
| 12.6171875 | 20.7 |
| 12.625 | 18.3 |
| 12.6328125 | 18.4 |
| 12.640625 | 22.1 |
| 12.6484375 | 24.7 |
| 12.65625 | 30.7 |
| 12.6640625 | 33.9 |
| 12.671875 | 28.4 |
| 12.6796875 | 21.4 |
| 12.6875 | 17.8 |
| 12.6953125 | 20.7 |
| 12.703125 | 24.5 |
| 12.7109375 | 18.4 |
| 12.71875 | 8.3 |
| 12.7265625 | 7.2 |
| 12.734375 | 14 |
| 12.7421875 | 16.3 |
| 12.75 | 12 |
| 12.7578125 | 11.4 |
| 12.765625 | 13.8 |
| 12.7734375 | 15.1 |
| 12.78125 | 13.6 |
| 12.7890625 | 4.4 |
| 12.796875 | -3.6 |
| 12.8046875 | -6.2 |
| 12.8125 | -14 |
| 12.8203125 | -22.2 |
| 12.828125 | -27 |
| 12.8359375 | -28.9 |
| 12.84375 | -18 |
| 12.8515625 | -6.3 |
| 12.859375 | -4.8 |
| 12.8671875 | 1.4 |
| 12.875 | 9 |
| 12.8828125 | 11.9 |
| 12.890625 | 20 |
| 12.8984375 | 27.3 |
| 12.90625 | 29.8 |
| 12.9140625 | 31.4 |
| 12.921875 | 29.9 |
| 12.9296875 | 31.2 |
| 12.9375 | 34.5 |
| 12.9453125 | 31.7 |
| 12.953125 | 33.3 |
| 12.9609375 | 40.8 |
| 12.96875 | 40.2 |
| 12.9765625 | 35 |
| 12.984375 | 34.8 |
| 12.9921875 | 36.4 |
| 13.0 | 37.4 |
| 13.0078125 | 37.8 |
| 13.015625 | 35.7 |
| 13.0234375 | 33.3 |
| 13.03125 | 35.6 |
| 13.0390625 | 41.3 |
| 13.046875 | 45.7 |
| 13.0546875 | 48.3 |
| 13.0625 | 50.7 |
| 13.0703125 | 52.6 |
| 13.078125 | 50.7 |
| 13.0859375 | 44.8 |
| 13.09375 | 39.6 |
| 13.1015625 | 34.4 |
| 13.109375 | 29.1 |
| 13.1171875 | 27.4 |
| 13.125 | 23.8 |
| 13.1328125 | 12.7 |
| 13.140625 | 3.5 |
| 13.1484375 | 0.8 |
| 13.15625 | -2.8 |
| 13.1640625 | -4.9 |
| 13.171875 | -0.5 |
| 13.1796875 | 6.6 |
| 13.1875 | 14.5 |
| 13.1953125 | 17.3 |
| 13.203125 | 15.3 |
| 13.2109375 | 18.4 |
| 13.21875 | 14.9 |
| 13.2265625 | 3 |
| 13.234375 | 6.2 |
| 13.2421875 | 11.3 |
| 13.25 | 1.3 |
| 13.2578125 | -6.3 |
| 13.265625 | -10.7 |
| 13.2734375 | -16 |
| 13.28125 | -14.9 |
| 13.2890625 | -14.8 |
| 13.296875 | -14.9 |
| 13.3046875 | -9.9 |
| 13.3125 | -7.9 |
| 13.3203125 | -7.1 |
| 13.328125 | -7.1 |
| 13.3359375 | -13.4 |
| 13.34375 | -18.6 |
| 13.3515625 | -16.8 |
| 13.359375 | -15.8 |
| 13.3671875 | -26.6 |
| 13.375 | -39.5 |
| 13.3828125 | -36.8 |
| 13.390625 | -35.2 |
| 13.3984375 | -45.9 |
| 13.40625 | -49.3 |
| 13.4140625 | -45.7 |
| 13.421875 | -43.7 |
| 13.4296875 | -41 |
| 13.4375 | -42.1 |
| 13.4453125 | -39.7 |
| 13.453125 | -28.6 |
| 13.4609375 | -22.2 |
| 13.46875 | -20.3 |
| 13.4765625 | -20.7 |
| 13.484375 | -27 |
| 13.4921875 | -28 |
| 13.5 | -27.6 |
| 13.5078125 | -35.5 |
| 13.515625 | -35.5 |
| 13.5234375 | -26.3 |
| 13.53125 | -23.8 |
| 13.5390625 | -25.8 |
| 13.546875 | -29.1 |
| 13.5546875 | -28.3 |
| 13.5625 | -16.9 |
| 13.5703125 | -9.1 |
| 13.578125 | -8.8 |
| 13.5859375 | -6.6 |
| 13.59375 | -6.1 |
| 13.6015625 | -2.6 |
| 13.609375 | 4.9 |
| 13.6171875 | 3.3 |
| 13.625 | 2.4 |
| 13.6328125 | 8.1 |
| 13.640625 | 11.1 |
| 13.6484375 | 17.2 |
| 13.65625 | 19 |
| 13.6640625 | 9.1 |
| 13.671875 | 7.3 |
| 13.6796875 | 13.2 |
| 13.6875 | 16.4 |
| 13.6953125 | 17 |
| 13.703125 | 11 |
| 13.7109375 | 12.2 |
| 13.71875 | 23.6 |
| 13.7265625 | 24.4 |
| 13.734375 | 25.4 |
| 13.7421875 | 30.8 |
| 13.75 | 28.8 |
| 13.7578125 | 32.8 |
| 13.765625 | 34.7 |
| 13.7734375 | 29.3 |
| 13.78125 | 44.1 |
| 13.7890625 | 61.7 |
| 13.796875 | 59 |
| 13.8046875 | 59.5 |
| 13.8125 | 62.7 |
| 13.8203125 | 55.8 |
| 13.828125 | 48.8 |
| 13.8359375 | 44.7 |
| 13.84375 | 42.1 |
| 13.8515625 | 36.4 |
| 13.859375 | 24.3 |
| 13.8671875 | 17.7 |
| 13.875 | 15 |
| 13.8828125 | 4.7 |
| 13.890625 | -5.8 |
| 13.8984375 | -10.7 |
| 13.90625 | -16.3 |
| 13.9140625 | -21.4 |
| 13.921875 | -20.3 |
| 13.9296875 | -15.9 |
| 13.9375 | -13.7 |
| 13.9453125 | -12.5 |
| 13.953125 | -10.1 |
| 13.9609375 | -11 |
| 13.96875 | -13.5 |
| 13.9765625 | -8.9 |
| 13.984375 | -5.6 |
| 13.9921875 | -13.5 |
| 14.0 | -18.5 |
| 14.0078125 | -18.4 |
| 14.015625 | -23.9 |
| 14.0234375 | -24.8 |
| 14.03125 | -21.9 |
| 14.0390625 | -27.2 |
| 14.046875 | -29.5 |
| 14.0546875 | -24.4 |
| 14.0625 | -19 |
| 14.0703125 | -11.5 |
| 14.078125 | -5.6 |
| 14.0859375 | 0 |
| 14.09375 | 7.4 |
| 14.1015625 | 9.8 |
| 14.109375 | 13.8 |
| 14.1171875 | 19.2 |
| 14.125 | 17.1 |
| 14.1328125 | 15.8 |
| 14.140625 | 14.3 |
| 14.1484375 | 10.3 |
| 14.15625 | 13.6 |
| 14.1640625 | 12.1 |
| 14.171875 | 0.8 |
| 14.1796875 | -4 |
| 14.1875 | -5.8 |
| 14.1953125 | -10.8 |
| 14.203125 | -16 |
| 14.2109375 | -24.3 |
| 14.21875 | -31.4 |
| 14.2265625 | -35.4 |
| 14.234375 | -38 |
| 14.2421875 | -35.4 |
| 14.25 | -33.7 |
| 14.2578125 | -35.9 |
| 14.265625 | -36.4 |
| 14.2734375 | -36.9 |
| 14.28125 | -36 |
| 14.2890625 | -35.2 |
| 14.296875 | -40.5 |
| 14.3046875 | -42 |
| 14.3125 | -36.1 |
| 14.3203125 | -32.9 |
| 14.328125 | -33.8 |
| 14.3359375 | -39.2 |
| 14.34375 | -42.1 |
| 14.3515625 | -35.4 |
| 14.359375 | -34.6 |
| 14.3671875 | -41.5 |
| 14.375 | -35.5 |
| 14.3828125 | -21.7 |
| 14.390625 | -15.4 |
| 14.3984375 | -12.7 |
| 14.40625 | -11.2 |
| 14.4140625 | -13.1 |
| 14.421875 | -18.6 |
| 14.4296875 | -24.7 |
| 14.4375 | -24.2 |
| 14.4453125 | -20.5 |
| 14.453125 | -21.4 |
| 14.4609375 | -19.5 |
| 14.46875 | -11.8 |
| 14.4765625 | -6 |
| 14.484375 | -2.7 |
| 14.4921875 | -1.8 |
| 14.5 | -4.4 |
| 14.5078125 | -4.1 |
| 14.515625 | -1.1 |
| 14.5234375 | -2.9 |
| 14.53125 | -5.5 |
| 14.5390625 | -5 |
| 14.546875 | -10.5 |
| 14.5546875 | -18.8 |
| 14.5625 | -16.9 |
| 14.5703125 | -11.5 |
| 14.578125 | -10.1 |
| 14.5859375 | -8 |
| 14.59375 | -9.8 |
| 14.6015625 | -14 |
| 14.609375 | -13.3 |
| 14.6171875 | -15.9 |
| 14.625 | -19.6 |
| 14.6328125 | -11.9 |
| 14.640625 | -0.8 |
| 14.6484375 | 2.4 |
| 14.65625 | -0.6 |
| 14.6640625 | 2.8 |
| 14.671875 | 18.4 |
| 14.6796875 | 21.1 |
| 14.6875 | 7.2 |
| 14.6953125 | 10.9 |
| 14.703125 | 23.1 |
| 14.7109375 | 20 |
| 14.71875 | 21.7 |
| 14.7265625 | 29.5 |
| 14.734375 | 26.7 |
| 14.7421875 | 23.5 |
| 14.75 | 20.1 |
| 14.7578125 | 12.2 |
| 14.765625 | 11.5 |
| 14.7734375 | 13.4 |
| 14.78125 | 9.3 |
| 14.7890625 | 6.6 |
| 14.796875 | 3.8 |
| 14.8046875 | -2.5 |
| 14.8125 | -1.2 |
| 14.8203125 | 4.8 |
| 14.828125 | 1.7 |
| 14.8359375 | 0.2 |
| 14.84375 | 10 |
| 14.8515625 | 13.7 |
| 14.859375 | 6.7 |
| 14.8671875 | 2 |
| 14.875 | 2.4 |
| 14.8828125 | 4.9 |
| 14.890625 | 4.5 |
| 14.8984375 | 3.9 |
| 14.90625 | 8.8 |
| 14.9140625 | 10 |
| 14.921875 | 9.5 |
| 14.9296875 | 11.6 |
| 14.9375 | 8.6 |
| 14.9453125 | 11.8 |
| 14.953125 | 20 |
| 14.9609375 | 14.1 |
| 14.96875 | 8.5 |
| 14.9765625 | 10.2 |
| 14.984375 | 6 |
| 14.9921875 | -0.5 |
| 15.0 | -3.5 |
| 15.0078125 | 2.4 |
| 15.015625 | 10.9 |
| 15.0234375 | 7.8 |
| 15.03125 | 7.6 |
| 15.0390625 | 12.7 |
| 15.046875 | 11.5 |
| 15.0546875 | 18.2 |
| 15.0625 | 27.9 |
| 15.0703125 | 26.1 |
| 15.078125 | 22.7 |
| 15.0859375 | 19.7 |
| 15.09375 | 18.6 |
| 15.1015625 | 19.1 |
| 15.109375 | 12.6 |
| 15.1171875 | 7.3 |
| 15.125 | 1.4 |
| 15.1328125 | -8.2 |
| 15.140625 | -6.4 |
| 15.1484375 | -2 |
| 15.15625 | -8 |
| 15.1640625 | -14.9 |
| 15.171875 | -17.2 |
| 15.1796875 | -11 |
| 15.1875 | -3.3 |
| 15.1953125 | -7.6 |
| 15.203125 | -10.1 |
| 15.2109375 | 1.8 |
| 15.21875 | 14 |
| 15.2265625 | 19.3 |
| 15.234375 | 23.8 |
| 15.2421875 | 27.7 |
| 15.25 | 28.6 |
| 15.2578125 | 26.6 |
| 15.265625 | 20.1 |
| 15.2734375 | 15.7 |
| 15.28125 | 16 |
| 15.2890625 | 11.1 |
| 15.296875 | 9.3 |
| 15.3046875 | 17.6 |
| 15.3125 | 17.8 |
| 15.3203125 | 10.6 |
| 15.328125 | 7 |
| 15.3359375 | 4.7 |
| 15.34375 | 3.1 |
| 15.3515625 | -3.7 |
| 15.359375 | -9.9 |
| 15.3671875 | -1.4 |
| 15.375 | 4.9 |
| 15.3828125 | -1 |
| 15.390625 | -4.2 |
| 15.3984375 | -2.8 |
| 15.40625 | -0.7 |
| 15.4140625 | -2 |
| 15.421875 | -6.6 |
| 15.4296875 | -7.2 |
| 15.4375 | -11.6 |
| 15.4453125 | -18.3 |
| 15.453125 | -14 |
| 15.4609375 | -10.6 |
| 15.46875 | -16.3 |
| 15.4765625 | -16.7 |
| 15.484375 | -7.6 |
| 15.4921875 | 4.1 |
| 15.5 | 13.8 |
| 15.5078125 | 17.8 |
| 15.515625 | 21.1 |
| 15.5234375 | 31.6 |
| 15.53125 | 40.1 |
| 15.5390625 | 38.2 |
| 15.546875 | 36.1 |
| 15.5546875 | 35.7 |
| 15.5625 | 35.5 |
| 15.5703125 | 43.5 |
| 15.578125 | 47.6 |
| 15.5859375 | 40 |
| 15.59375 | 33.8 |
| 15.6015625 | 26.4 |
| 15.609375 | 21.8 |
| 15.6171875 | 26.9 |
| 15.625 | 23.1 |
| 15.6328125 | 13.8 |
| 15.640625 | 11.8 |
| 15.6484375 | 7.1 |
| 15.65625 | 4.7 |
| 15.6640625 | 5.9 |
| 15.671875 | -0.7 |
| 15.6796875 | -7.6 |
| 15.6875 | -10.5 |
| 15.6953125 | -12.3 |
| 15.703125 | -13.9 |
| 15.7109375 | -20.1 |
| 15.71875 | -24 |
| 15.7265625 | -23.4 |
| 15.734375 | -23.6 |
| 15.7421875 | -19.8 |
| 15.75 | -17.1 |
| 15.7578125 | -18.4 |
| 15.765625 | -15.9 |
| 15.7734375 | -16.4 |
| 15.78125 | -17.5 |
| 15.7890625 | -14.9 |
| 15.796875 | -22.6 |
| 15.8046875 | -29.8 |
| 15.8125 | -22.6 |
| 15.8203125 | -20.8 |
| 15.828125 | -27.3 |
| 15.8359375 | -28.7 |
| 15.84375 | -31.2 |
| 15.8515625 | -34.7 |
| 15.859375 | -32.6 |
| 15.8671875 | -32.3 |
| 15.875 | -32.7 |
| 15.8828125 | -28.1 |
| 15.890625 | -21.6 |
| 15.8984375 | -13.3 |
| 15.90625 | -6.6 |
| 15.9140625 | -2.3 |
| 15.921875 | 3.2 |
| 15.9296875 | 1.8 |
| 15.9375 | -3 |
| 15.9453125 | -2.4 |
| 15.953125 | -11.7 |
| 15.9609375 | -27.8 |
| 15.96875 | -30.7 |
| 15.9765625 | -27.1 |
| 15.984375 | -26.9 |
| 15.9921875 | -28 |
| 16.0 | -28.4 |
| 16.0078125 | -23.5 |
| 16.015625 | -15.4 |
| 16.0234375 | -7.6 |
| 16.03125 | -2.2 |
| 16.0390625 | -3.8 |
| 16.046875 | -4 |
| 16.0546875 | 3.4 |
| 16.0625 | 7.9 |
| 16.0703125 | 8.8 |
| 16.078125 | 13.3 |
| 16.0859375 | 18.6 |
| 16.09375 | 21.5 |
| 16.1015625 | 22.6 |
| 16.109375 | 19.9 |
| 16.1171875 | 12.8 |
| 16.125 | 4.9 |
| 16.1328125 | -2 |
| 16.140625 | -8.4 |
| 16.1484375 | -14 |
| 16.15625 | -18.2 |
| 16.1640625 | -14.5 |
| 16.171875 | -1.3 |
| 16.1796875 | 10.4 |
| 16.1875 | 14.8 |
| 16.1953125 | 8.4 |
| 16.203125 | -5.5 |
| 16.2109375 | -6 |
| 16.21875 | 3.2 |
| 16.2265625 | 1.5 |
| 16.234375 | -0.7 |
| 16.2421875 | 7.2 |
| 16.25 | 16.5 |
| 16.2578125 | 21.2 |
| 16.265625 | 18.5 |
| 16.2734375 | 11.9 |
| 16.28125 | 6 |
| 16.2890625 | 1.1 |
| 16.296875 | 1.5 |
| 16.3046875 | 6.2 |
| 16.3125 | 13.9 |
| 16.3203125 | 21.3 |
| 16.328125 | 19.8 |
| 16.3359375 | 21.2 |
| 16.34375 | 31.3 |
| 16.3515625 | 29.4 |
| 16.359375 | 20.7 |
| 16.3671875 | 21.8 |
| 16.375 | 27 |
| 16.3828125 | 33.8 |
| 16.390625 | 42.5 |
| 16.3984375 | 48.4 |
| 16.40625 | 49.8 |
| 16.4140625 | 46.9 |
| 16.421875 | 45.1 |
| 16.4296875 | 43.3 |
| 16.4375 | 37.9 |
| 16.4453125 | 35.7 |
| 16.453125 | 32.6 |
| 16.4609375 | 26 |
| 16.46875 | 24.5 |
| 16.4765625 | 23.6 |
| 16.484375 | 22 |
| 16.4921875 | 26.2 |
| 16.5 | 29.2 |
| 16.5078125 | 26 |
| 16.515625 | 18.4 |
| 16.5234375 | 11.7 |
| 16.53125 | 5.9 |
| 16.5390625 | -9.4 |
| 16.546875 | -20.9 |
| 16.5546875 | -18.2 |
| 16.5625 | -23.8 |
| 16.5703125 | -28.4 |
| 16.578125 | -19.7 |
| 16.5859375 | -23.7 |
| 16.59375 | -28.4 |
| 16.6015625 | -15.7 |
| 16.609375 | -13.1 |
| 16.6171875 | -15.1 |
| 16.625 | -4.7 |
| 16.6328125 | -2.1 |
| 16.640625 | -6 |
| 16.6484375 | -7.4 |
| 16.65625 | -13.2 |
| 16.6640625 | -15.8 |
| 16.671875 | -16.8 |
| 16.6796875 | -19.1 |
| 16.6875 | -11.3 |
| 16.6953125 | -6.5 |
| 16.703125 | -8.8 |
| 16.7109375 | -3.1 |
| 16.71875 | -2.5 |
| 16.7265625 | -8.8 |
| 16.734375 | -6 |
| 16.7421875 | -6.4 |
| 16.75 | -12.1 |
| 16.7578125 | -10.5 |
| 16.765625 | -10.8 |
| 16.7734375 | -15.2 |
| 16.78125 | -17.3 |
| 16.7890625 | -20.8 |
| 16.796875 | -19 |
| 16.8046875 | -10.9 |
| 16.8125 | -9.1 |
| 16.8203125 | -10 |
| 16.828125 | -6.9 |
| 16.8359375 | -5.4 |
| 16.84375 | -6 |
| 16.8515625 | -9.6 |
| 16.859375 | -17.7 |
| 16.8671875 | -23.9 |
| 16.875 | -29 |
| 16.8828125 | -36.1 |
| 16.890625 | -39.8 |
| 16.8984375 | -43.3 |
| 16.90625 | -50.5 |
| 16.9140625 | -49.2 |
| 16.921875 | -40.3 |
| 16.9296875 | -39.8 |
| 16.9375 | -44.6 |
| 16.9453125 | -45.4 |
| 16.953125 | -45 |
| 16.9609375 | -41.5 |
| 16.96875 | -34.3 |
| 16.9765625 | -29.4 |
| 16.984375 | -24.3 |
| 16.9921875 | -15.8 |
| 17.0 | -8.8 |
| 17.0078125 | -8.4 |
| 17.015625 | -10.2 |
| 17.0234375 | -5.3 |
| 17.03125 | -1.9 |
| 17.0390625 | -4.8 |
| 17.046875 | 2.1 |
| 17.0546875 | 11.7 |
| 17.0625 | 9.9 |
| 17.0703125 | 13.5 |
| 17.078125 | 20.5 |
| 17.0859375 | 17.5 |
| 17.09375 | 16.3 |
| 17.1015625 | 13.9 |
| 17.109375 | 6.4 |
| 17.1171875 | 7.7 |
| 17.125 | 7.4 |
| 17.1328125 | 0.9 |
| 17.140625 | 8 |
| 17.1484375 | 15.8 |
| 17.15625 | 5.3 |
| 17.1640625 | -5.1 |
| 17.171875 | -5.6 |
| 17.1796875 | -9.7 |
| 17.1875 | -15.8 |
| 17.1953125 | -14.9 |
| 17.203125 | -11.9 |
| 17.2109375 | -9.3 |
| 17.21875 | -4.6 |
| 17.2265625 | -1.5 |
| 17.234375 | 1.9 |
| 17.2421875 | 6 |
| 17.25 | 5.9 |
| 17.2578125 | 8.8 |
| 17.265625 | 13.9 |
| 17.2734375 | 14.8 |
| 17.28125 | 23.6 |
| 17.2890625 | 37.2 |
| 17.296875 | 40.4 |
| 17.3046875 | 41.4 |
| 17.3125 | 41.4 |
| 17.3203125 | 39.7 |
| 17.328125 | 44.3 |
| 17.3359375 | 45.8 |
| 17.34375 | 45.2 |
| 17.3515625 | 51.1 |
| 17.359375 | 48.4 |
| 17.3671875 | 40.6 |
| 17.375 | 41 |
| 17.3828125 | 38 |
| 17.390625 | 30.3 |
| 17.3984375 | 24.6 |
| 17.40625 | 19.7 |
| 17.4140625 | 18.1 |
| 17.421875 | 14.1 |
| 17.4296875 | 8.5 |
| 17.4375 | 12 |
| 17.4453125 | 17.6 |
| 17.453125 | 17.9 |
| 17.4609375 | 12.3 |
| 17.46875 | 3.4 |
| 17.4765625 | 1 |
| 17.484375 | -1.9 |
| 17.4921875 | -11.8 |
| 17.5 | -12.9 |
| 17.5078125 | -7.2 |
| 17.515625 | -8.8 |
| 17.5234375 | -13.5 |
| 17.53125 | -14.7 |
| 17.5390625 | -8.1 |
| 17.546875 | 0.4 |
| 17.5546875 | 0.2 |
| 17.5625 | 0 |
| 17.5703125 | 5.6 |
| 17.578125 | 7.3 |
| 17.5859375 | 4.5 |
| 17.59375 | 1.6 |
| 17.6015625 | -1 |
| 17.609375 | -0.2 |
| 17.6171875 | 7.3 |
| 17.625 | 14.3 |
| 17.6328125 | 10.8 |
| 17.640625 | 5.2 |
| 17.6484375 | 10.8 |
| 17.65625 | 18.5 |
| 17.6640625 | 16.3 |
| 17.671875 | 9.4 |
| 17.6796875 | 6.6 |
| 17.6875 | 7.5 |
| 17.6953125 | 8.4 |
| 17.703125 | 10.3 |
| 17.7109375 | 8.5 |
| 17.71875 | -3.9 |
| 17.7265625 | -10.3 |
| 17.734375 | 0.8 |
| 17.7421875 | 11.3 |
| 17.75 | 11 |
| 17.7578125 | 6.9 |
| 17.765625 | 4.4 |
| 17.7734375 | 6.3 |
| 17.78125 | 4.5 |
| 17.7890625 | -1.6 |
| 17.796875 | -0.6 |
| 17.8046875 | -2.3 |
| 17.8125 | -9.8 |
| 17.8203125 | -9 |
| 17.828125 | -12.7 |
| 17.8359375 | -22.6 |
| 17.84375 | -19.5 |
| 17.8515625 | -18.1 |
| 17.859375 | -26.5 |
| 17.8671875 | -28.3 |
| 17.875 | -30.3 |
| 17.8828125 | -32.6 |
| 17.890625 | -27.3 |
| 17.8984375 | -28.3 |
| 17.90625 | -34.1 |
| 17.9140625 | -32.7 |
| 17.921875 | -32 |
| 17.9296875 | -32.1 |
| 17.9375 | -28.7 |
| 17.9453125 | -32.9 |
| 17.953125 | -44.7 |
| 17.9609375 | -49.2 |
| 17.96875 | -46.6 |
| 17.9765625 | -45.6 |
| 17.984375 | -43.2 |
| 17.9921875 | -40.9 |
| 18.0 | -41.3 |
| 18.0078125 | -34.5 |
| 18.015625 | -28.6 |
| 18.0234375 | -32 |
| 18.03125 | -29.2 |
| 18.0390625 | -21 |
| 18.046875 | -16.5 |
| 18.0546875 | -12.4 |
| 18.0625 | -12.5 |
| 18.0703125 | -12.5 |
| 18.078125 | -11.1 |
| 18.0859375 | -15.3 |
| 18.09375 | -9.1 |
| 18.1015625 | 5.2 |
| 18.109375 | 8.4 |
| 18.1171875 | 14.6 |
| 18.125 | 26.4 |
| 18.1328125 | 32 |
| 18.140625 | 40.7 |
| 18.1484375 | 43.2 |
| 18.15625 | 29.6 |
| 18.1640625 | 21.2 |
| 18.171875 | 18.7 |
| 18.1796875 | 9.1 |
| 18.1875 | 5 |
| 18.1953125 | 8.7 |
| 18.203125 | 2.9 |
| 18.2109375 | -4 |
| 18.21875 | 1.4 |
| 18.2265625 | 2.7 |
| 18.234375 | -5.5 |
| 18.2421875 | -6.7 |
| 18.25 | -4.3 |
| 18.2578125 | -6 |
| 18.265625 | -4.3 |
| 18.2734375 | -1.3 |
| 18.28125 | 1.3 |
| 18.2890625 | 5 |
| 18.296875 | 1.1 |
| 18.3046875 | -5.9 |
| 18.3125 | -6.3 |
| 18.3203125 | -10.6 |
| 18.328125 | -16.9 |
| 18.3359375 | -14.9 |
| 18.34375 | -12.9 |
| 18.3515625 | -10.5 |
| 18.359375 | -4 |
| 18.3671875 | -5.9 |
| 18.375 | -7.5 |
| 18.3828125 | 1.7 |
| 18.390625 | 3.7 |
| 18.3984375 | -0.7 |
| 18.40625 | 3.9 |
| 18.4140625 | 9.8 |
| 18.421875 | 13 |
| 18.4296875 | 15.4 |
| 18.4375 | 10.1 |
| 18.4453125 | 0.4 |
| 18.453125 | -4.5 |
| 18.4609375 | -1.5 |
| 18.46875 | 2.8 |
| 18.4765625 | -2.4 |
| 18.484375 | -9.6 |
| 18.4921875 | -11.6 |
| 18.5 | -17.5 |
| 18.5078125 | -21.1 |
| 18.515625 | -17.4 |
| 18.5234375 | -19.1 |
| 18.53125 | -20.7 |
| 18.5390625 | -14.5 |
| 18.546875 | -12.6 |
| 18.5546875 | -17.2 |
| 18.5625 | -19.6 |
| 18.5703125 | -21.2 |
| 18.578125 | -25.7 |
| 18.5859375 | -27.3 |
| 18.59375 | -20 |
| 18.6015625 | -7.9 |
| 18.609375 | 1.8 |
| 18.6171875 | 7.8 |
| 18.625 | 11.7 |
| 18.6328125 | 16.7 |
| 18.640625 | 21.2 |
| 18.6484375 | 19.8 |
| 18.65625 | 15.5 |
| 18.6640625 | 14.8 |
| 18.671875 | 16.3 |
| 18.6796875 | 13 |
| 18.6875 | 8.5 |
| 18.6953125 | 12.1 |
| 18.703125 | 14.4 |
| 18.7109375 | 10 |
| 18.71875 | 10.3 |
| 18.7265625 | 5.7 |
| 18.734375 | -8.5 |
| 18.7421875 | -12.8 |
| 18.75 | -13.4 |
| 18.7578125 | -20.4 |
| 18.765625 | -25.8 |
| 18.7734375 | -36.4 |
| 18.78125 | -47.1 |
| 18.7890625 | -46.5 |
| 18.796875 | -48.8 |
| 18.8046875 | -54.2 |
| 18.8125 | -54 |
| 18.8203125 | -53.5 |
| 18.828125 | -49.1 |
| 18.8359375 | -41.2 |
| 18.84375 | -36.1 |
| 18.8515625 | -31.9 |
| 18.859375 | -33.6 |
| 18.8671875 | -31.7 |
| 18.875 | -14 |
| 18.8828125 | -1.2 |
| 18.890625 | 4.9 |
| 18.8984375 | 18.4 |
| 18.90625 | 25 |
| 18.9140625 | 22.7 |
| 18.921875 | 19.6 |
| 18.9296875 | 11 |
| 18.9375 | 9.8 |
| 18.9453125 | 15.4 |
| 18.953125 | 12.6 |
| 18.9609375 | 16.2 |
| 18.96875 | 23 |
| 18.9765625 | 17.6 |
| 18.984375 | 19.1 |
| 18.9921875 | 27.4 |
| 19.0 | 26.1 |
| 19.0078125 | 25.4 |
| 19.015625 | 27.6 |
| 19.0234375 | 30.7 |
| 19.03125 | 35.3 |
| 19.0390625 | 34.3 |
| 19.046875 | 38.4 |
| 19.0546875 | 47.1 |
| 19.0625 | 41.6 |
| 19.0703125 | 37 |
| 19.078125 | 40.7 |
| 19.0859375 | 35.7 |
| 19.09375 | 32.2 |
| 19.1015625 | 37.1 |
| 19.109375 | 38.8 |
| 19.1171875 | 38.1 |
| 19.125 | 41.8 |
| 19.1328125 | 54.4 |
| 19.140625 | 63.5 |
| 19.1484375 | 57 |
| 19.15625 | 50.6 |
| 19.1640625 | 47.2 |
| 19.171875 | 39.3 |
| 19.1796875 | 36.8 |
| 19.1875 | 32.2 |
| 19.1953125 | 21.6 |
| 19.203125 | 23.2 |
| 19.2109375 | 32.9 |
| 19.21875 | 39.1 |
| 19.2265625 | 37.8 |
| 19.234375 | 27.7 |
| 19.2421875 | 23.1 |
| 19.25 | 25.5 |
| 19.2578125 | 21.7 |
| 19.265625 | 17.7 |
| 19.2734375 | 18.5 |
| 19.28125 | 16.2 |
| 19.2890625 | 10.9 |
| 19.296875 | 8.5 |
| 19.3046875 | 13.3 |
| 19.3125 | 17.6 |
| 19.3203125 | 18.3 |
| 19.328125 | 24.9 |
| 19.3359375 | 30.6 |
| 19.34375 | 27.7 |
| 19.3515625 | 27.7 |
| 19.359375 | 29.6 |
| 19.3671875 | 28.5 |
| 19.375 | 32 |
| 19.3828125 | 38.3 |
| 19.390625 | 42.9 |
| 19.3984375 | 46.2 |
| 19.40625 | 42.8 |
| 19.4140625 | 37.6 |
| 19.421875 | 36.3 |
| 19.4296875 | 29.7 |
| 19.4375 | 20.3 |
| 19.4453125 | 14.8 |
| 19.453125 | 9.4 |
| 19.4609375 | 9.6 |
| 19.46875 | 12.7 |
| 19.4765625 | 9.1 |
| 19.484375 | 10.8 |
| 19.4921875 | 16.2 |
| 19.5 | 10.8 |
| 19.5078125 | 6.2 |
| 19.515625 | 7.2 |
| 19.5234375 | 3.5 |
| 19.53125 | -2.1 |
| 19.5390625 | -5.2 |
| 19.546875 | -7.1 |
| 19.5546875 | -10 |
| 19.5625 | -13.2 |
| 19.5703125 | -9.8 |
| 19.578125 | -7.1 |
| 19.5859375 | -15 |
| 19.59375 | -21.2 |
| 19.6015625 | -22.6 |
| 19.609375 | -26.6 |
| 19.6171875 | -21.7 |
| 19.625 | -5.7 |
| 19.6328125 | 2.4 |
| 19.640625 | -5 |
| 19.6484375 | -16.2 |
| 19.65625 | -20.3 |
| 19.6640625 | -22.1 |
| 19.671875 | -25 |
| 19.6796875 | -23.4 |
| 19.6875 | -24.9 |
| 19.6953125 | -29 |
| 19.703125 | -24.5 |
| 19.7109375 | -23.3 |
| 19.71875 | -25.4 |
| 19.7265625 | -15.6 |
| 19.734375 | -6.4 |
| 19.7421875 | -3.3 |
| 19.75 | 0.9 |
| 19.7578125 | 3.4 |
| 19.765625 | 8.2 |
| 19.7734375 | 5.5 |
| 19.78125 | -9.2 |
| 19.7890625 | -13.4 |
| 19.796875 | -10 |
| 19.8046875 | -11.4 |
| 19.8125 | -9 |
| 19.8203125 | -5.1 |
| 19.828125 | -2.6 |
| 19.8359375 | -1.7 |
| 19.84375 | -6.9 |
| 19.8515625 | -11.2 |
| 19.859375 | -11.6 |
| 19.8671875 | -11.5 |
| 19.875 | -9.8 |
| 19.8828125 | -6.4 |
| 19.890625 | 0.7 |
| 19.8984375 | 4.8 |
| 19.90625 | 1.9 |
| 19.9140625 | 3 |
| 19.921875 | 7.3 |
| 19.9296875 | 10.4 |
| 19.9375 | 15.5 |
| 19.9453125 | 17.7 |
| 19.953125 | 16 |
| 19.9609375 | 17.4 |
| 19.96875 | 22.8 |
| 19.9765625 | 29.8 |
| 19.984375 | 33.5 |
| 19.9921875 | 31 |
| 20.0 | 23.6 |
| 20.0078125 | 18.2 |
| 20.015625 | 17.3 |
| 20.0234375 | 12.4 |
| 20.03125 | 6.9 |
| 20.0390625 | 6.3 |
| 20.046875 | 0 |
| 20.0546875 | -7.8 |
| 20.0625 | -11.8 |
| 20.0703125 | -23.3 |
| 20.078125 | -38.9 |
| 20.0859375 | -54.3 |
| 20.09375 | -67.5 |
| 20.1015625 | -66.6 |
| 20.109375 | -62.5 |
| 20.1171875 | -65.6 |
| 20.125 | -56.9 |
| 20.1328125 | -41.7 |
| 20.140625 | -38.2 |
| 20.1484375 | -35.5 |
| 20.15625 | -31.3 |
| 20.1640625 | -30.5 |
| 20.171875 | -23.4 |
| 20.1796875 | -16.8 |
| 20.1875 | -18.7 |
| 20.1953125 | -16.5 |
| 20.203125 | -11.9 |
| 20.2109375 | -10.3 |
| 20.21875 | -8.2 |
| 20.2265625 | -16.7 |
| 20.234375 | -31 |
| 20.2421875 | -30.1 |
| 20.25 | -25.7 |
| 20.2578125 | -26.5 |
| 20.265625 | -17.9 |
| 20.2734375 | -7.8 |
| 20.28125 | -4 |
| 20.2890625 | 6 |
| 20.296875 | 19.2 |
| 20.3046875 | 26 |
| 20.3125 | 24.8 |
| 20.3203125 | 17.6 |
| 20.328125 | 13.9 |
| 20.3359375 | 15.1 |
| 20.34375 | 15 |
| 20.3515625 | 11.9 |
| 20.359375 | 4.8 |
| 20.3671875 | 3.3 |
| 20.375 | 6 |
| 20.3828125 | -5 |
| 20.390625 | -19.7 |
| 20.3984375 | -23.1 |
| 20.40625 | -24.3 |
| 20.4140625 | -26.6 |
| 20.421875 | -32.4 |
| 20.4296875 | -42.7 |
| 20.4375 | -43.7 |
| 20.4453125 | -36.8 |
| 20.453125 | -36.2 |
| 20.4609375 | -40.6 |
| 20.46875 | -41.3 |
| 20.4765625 | -38.9 |
| 20.484375 | -39.4 |
| 20.4921875 | -42.7 |
| 20.5 | -43.8 |
| 20.5078125 | -41.1 |
| 20.515625 | -35.4 |
| 20.5234375 | -34.4 |
| 20.53125 | -40.6 |
| 20.5390625 | -46.3 |
| 20.546875 | -50.7 |
| 20.5546875 | -54.7 |
| 20.5625 | -59 |
| 20.5703125 | -62.5 |
| 20.578125 | -56.1 |
| 20.5859375 | -47.8 |
| 20.59375 | -47.6 |
| 20.6015625 | -41.5 |
| 20.609375 | -31.8 |
| 20.6171875 | -28.2 |
| 20.625 | -20.2 |
| 20.6328125 | -10.9 |
| 20.640625 | -8.2 |
| 20.6484375 | -6.1 |
| 20.65625 | -3.1 |
| 20.6640625 | 2.4 |
| 20.671875 | 10.7 |
| 20.6796875 | 12.3 |
| 20.6875 | 8.1 |
| 20.6953125 | 8.7 |
| 20.703125 | 15.6 |
| 20.7109375 | 22.2 |
| 20.71875 | 26.3 |
| 20.7265625 | 29.7 |
| 20.734375 | 30.9 |
| 20.7421875 | 29.6 |
| 20.75 | 28.6 |
| 20.7578125 | 25.3 |
| 20.765625 | 22.2 |
| 20.7734375 | 26.2 |
| 20.78125 | 31.2 |
| 20.7890625 | 27.1 |
| 20.796875 | 16.2 |
| 20.8046875 | 7.6 |
| 20.8125 | 3.8 |
| 20.8203125 | 3.8 |
| 20.828125 | 7.5 |
| 20.8359375 | 5.1 |
| 20.84375 | -8.3 |
| 20.8515625 | -15.2 |
| 20.859375 | -11.1 |
| 20.8671875 | -15.1 |
| 20.875 | -22.2 |
| 20.8828125 | -18.5 |
| 20.890625 | -19.2 |
| 20.8984375 | -27.9 |
| 20.90625 | -25.5 |
| 20.9140625 | -21 |
| 20.921875 | -25.2 |
| 20.9296875 | -18.4 |
| 20.9375 | -1.8 |
| 20.9453125 | 2.8 |
| 20.953125 | 2.6 |
| 20.9609375 | 8.5 |
| 20.96875 | 10.3 |
| 20.9765625 | 8.8 |
| 20.984375 | 15.6 |
| 20.9921875 | 28.7 |
| 21.0 | 36.8 |
| 21.0078125 | 37 |
| 21.015625 | 37.7 |
| 21.0234375 | 39.8 |
| 21.03125 | 35 |
| 21.0390625 | 27.7 |
| 21.046875 | 29.4 |
| 21.0546875 | 32.8 |
| 21.0625 | 27.7 |
| 21.0703125 | 21.3 |
| 21.078125 | 15.2 |
| 21.0859375 | 5.6 |
| 21.09375 | 3.8 |
| 21.1015625 | 9.1 |
| 21.109375 | 6.6 |
| 21.1171875 | 4.1 |
| 21.125 | 6.4 |
| 21.1328125 | 1.3 |
| 21.140625 | -0.7 |
| 21.1484375 | 8.1 |
| 21.15625 | 14.4 |
| 21.1640625 | 18 |
| 21.171875 | 19.3 |
| 21.1796875 | 14.7 |
| 21.1875 | 13.7 |
| 21.1953125 | 15.7 |
| 21.203125 | 18.7 |
| 21.2109375 | 27.8 |
| 21.21875 | 30.1 |
| 21.2265625 | 25 |
| 21.234375 | 28.5 |
| 21.2421875 | 32.1 |
| 21.25 | 27 |
| 21.2578125 | 22.5 |
| 21.265625 | 20.2 |
| 21.2734375 | 19.8 |
| 21.28125 | 23.2 |
| 21.2890625 | 24.8 |
| 21.296875 | 23.4 |
| 21.3046875 | 22.1 |
| 21.3125 | 18.4 |
| 21.3203125 | 15 |
| 21.328125 | 18.7 |
| 21.3359375 | 24.1 |
| 21.34375 | 24.3 |
| 21.3515625 | 25 |
| 21.359375 | 26.4 |
| 21.3671875 | 24.8 |
| 21.375 | 21.1 |
| 21.3828125 | 10.4 |
| 21.390625 | -2.6 |
| 21.3984375 | -1.8 |
| 21.40625 | 5.1 |
| 21.4140625 | 2.1 |
| 21.421875 | -1.1 |
| 21.4296875 | 4.2 |
| 21.4375 | 7.2 |
| 21.4453125 | 1 |
| 21.453125 | -3.6 |
| 21.4609375 | 1.7 |
| 21.46875 | 5.9 |
| 21.4765625 | 4.9 |
| 21.484375 | 8.8 |
| 21.4921875 | 10.5 |
| 21.5 | 5.1 |
| 21.5078125 | 4.3 |
| 21.515625 | 2.3 |
| 21.5234375 | -5.2 |
| 21.53125 | -3.5 |
| 21.5390625 | -0.2 |
| 21.546875 | -9.5 |
| 21.5546875 | -20.5 |
| 21.5625 | -24.1 |
| 21.5703125 | -25.2 |
| 21.578125 | -28.1 |
| 21.5859375 | -30.5 |
| 21.59375 | -28.4 |
| 21.6015625 | -28.3 |
| 21.609375 | -32.3 |
| 21.6171875 | -32 |
| 21.625 | -31.4 |
| 21.6328125 | -35 |
| 21.640625 | -34 |
| 21.6484375 | -32.7 |
| 21.65625 | -38.2 |
| 21.6640625 | -36.3 |
| 21.671875 | -23.6 |
| 21.6796875 | -16.8 |
| 21.6875 | -10.7 |
| 21.6953125 | 5.9 |
| 21.703125 | 16 |
| 21.7109375 | 11.9 |
| 21.71875 | 6.1 |
| 21.7265625 | -1.8 |
| 21.734375 | -4.6 |
| 21.7421875 | 4.7 |
| 21.75 | 7.1 |
| 21.7578125 | 1.4 |
| 21.765625 | 3.4 |
| 21.7734375 | 7.5 |
| 21.78125 | 10 |
| 21.7890625 | 9 |
| 21.796875 | 0 |
| 21.8046875 | -5.5 |
| 21.8125 | -7.6 |
| 21.8203125 | -13.2 |
| 21.828125 | -16.8 |
| 21.8359375 | -23.5 |
| 21.84375 | -26.5 |
| 21.8515625 | -16.7 |
| 21.859375 | -18.4 |
| 21.8671875 | -30.7 |
| 21.875 | -27.9 |
| 21.8828125 | -19.5 |
| 21.890625 | -12.2 |
| 21.8984375 | -1.7 |
| 21.90625 | 4.8 |
| 21.9140625 | 10.8 |
| 21.921875 | 13.7 |
| 21.9296875 | 11 |
| 21.9375 | 15.5 |
| 21.9453125 | 21.3 |
| 21.953125 | 26.9 |
| 21.9609375 | 44 |
| 21.96875 | 51.4 |
| 21.9765625 | 42 |
| 21.984375 | 42.6 |
| 21.9921875 | 48.8 |
| 22.0 | 49 |
| 22.0078125 | 53.5 |
| 22.015625 | 55.7 |
| 22.0234375 | 51.5 |
| 22.03125 | 51.4 |
| 22.0390625 | 50 |
| 22.046875 | 50.5 |
| 22.0546875 | 62.4 |
| 22.0625 | 66.6 |
| 22.0703125 | 59.5 |
| 22.078125 | 60.2 |
| 22.0859375 | 63.5 |
| 22.09375 | 63.8 |
| 22.1015625 | 59.2 |
| 22.109375 | 40.4 |
| 22.1171875 | 23.4 |
| 22.125 | 17.9 |
| 22.1328125 | 7.4 |
| 22.140625 | -4 |
| 22.1484375 | -11.5 |
| 22.15625 | -22 |
| 22.1640625 | -26.1 |
| 22.171875 | -24.3 |
| 22.1796875 | -27 |
| 22.1875 | -27.7 |
| 22.1953125 | -19.6 |
| 22.203125 | -5.3 |
| 22.2109375 | 0.3 |
| 22.21875 | -10.9 |
| 22.2265625 | -16.6 |
| 22.234375 | -8.2 |
| 22.2421875 | -4.4 |
| 22.25 | -9.9 |
| 22.2578125 | -20.1 |
| 22.265625 | -26.9 |
| 22.2734375 | -24.4 |
| 22.28125 | -24.4 |
| 22.2890625 | -24.9 |
| 22.296875 | -13.5 |
| 22.3046875 | -3.3 |
| 22.3125 | -0.3 |
| 22.3203125 | 5.5 |
| 22.328125 | 6.5 |
| 22.3359375 | 0 |
| 22.34375 | -2.2 |
| 22.3515625 | -0.9 |
| 22.359375 | -0.4 |
| 22.3671875 | 0.1 |
| 22.375 | -4.7 |
| 22.3828125 | -14.7 |
| 22.390625 | -21.2 |
| 22.3984375 | -20.8 |
| 22.40625 | -18.9 |
| 22.4140625 | -19.2 |
| 22.421875 | -14.9 |
| 22.4296875 | -4.2 |
| 22.4375 | 1.1 |
| 22.4453125 | 0.8 |
| 22.453125 | 1.5 |
| 22.4609375 | -1.2 |
| 22.46875 | -3.6 |
| 22.4765625 | -0.3 |
| 22.484375 | -0.5 |
| 22.4921875 | -3.6 |
| 22.5 | -1.2 |
| 22.5078125 | 2.3 |
| 22.515625 | 3.8 |
| 22.5234375 | 3.3 |
| 22.53125 | -0.5 |
| 22.5390625 | -4.2 |
| 22.546875 | -8.8 |
| 22.5546875 | -15.7 |
| 22.5625 | -18.6 |
| 22.5703125 | -19.5 |
| 22.578125 | -21.4 |
| 22.5859375 | -20.1 |
| 22.59375 | -18.8 |
| 22.6015625 | -17.4 |
| 22.609375 | -10.6 |
| 22.6171875 | -8.4 |
| 22.625 | -19.7 |
| 22.6328125 | -30.7 |
| 22.640625 | -31 |
| 22.6484375 | -29.5 |
| 22.65625 | -32 |
| 22.6640625 | -29.9 |
| 22.671875 | -24.1 |
| 22.6796875 | -22.9 |
| 22.6875 | -18.6 |
| 22.6953125 | -12 |
| 22.703125 | -16.5 |
| 22.7109375 | -21.5 |
| 22.71875 | -18.2 |
| 22.7265625 | -16.2 |
| 22.734375 | -13.1 |
| 22.7421875 | -11.6 |
| 22.75 | -19.3 |
| 22.7578125 | -22.1 |
| 22.765625 | -16.7 |
| 22.7734375 | -15.9 |
| 22.78125 | -13.2 |
| 22.7890625 | -6.6 |
| 22.796875 | -11.1 |
| 22.8046875 | -23.1 |
| 22.8125 | -27.2 |
| 22.8203125 | -25.2 |
| 22.828125 | -26.8 |
| 22.8359375 | -28.2 |
| 22.84375 | -21.6 |
| 22.8515625 | -15.8 |
| 22.859375 | -17.3 |
| 22.8671875 | -15.8 |
| 22.875 | -11.4 |
| 22.8828125 | -11.2 |
| 22.890625 | -10.5 |
| 22.8984375 | -8.2 |
| 22.90625 | -7.4 |
| 22.9140625 | -9.3 |
| 22.921875 | -14.1 |
| 22.9296875 | -13.9 |
| 22.9375 | -8.3 |
| 22.9453125 | -4.4 |
| 22.953125 | 1.5 |
| 22.9609375 | -0.4 |
| 22.96875 | -14 |
| 22.9765625 | -11.6 |
| 22.984375 | 1.6 |
| 22.9921875 | -0.4 |
| 23.0 | -4 |
| 23.0078125 | -1 |
| 23.015625 | -2.1 |
| 23.0234375 | -4.5 |
| 23.03125 | -7.9 |
| 23.0390625 | -5.3 |
| 23.046875 | 7.1 |
| 23.0546875 | 6.9 |
| 23.0625 | -5.3 |
| 23.0703125 | -8.6 |
| 23.078125 | -4.7 |
| 23.0859375 | 4.7 |
| 23.09375 | 13.5 |
| 23.1015625 | 9.8 |
| 23.109375 | 11.3 |
| 23.1171875 | 22.7 |
| 23.125 | 21.4 |
| 23.1328125 | 17.8 |
| 23.140625 | 23.3 |
| 23.1484375 | 22 |
| 23.15625 | 19.2 |
| 23.1640625 | 22.2 |
| 23.171875 | 18.9 |
| 23.1796875 | 13 |
| 23.1875 | 10.2 |
| 23.1953125 | 7.3 |
| 23.203125 | 8.2 |
| 23.2109375 | 6.4 |
| 23.21875 | -0.1 |
| 23.2265625 | 2.7 |
| 23.234375 | 9.5 |
| 23.2421875 | 10.8 |
| 23.25 | 9.5 |
| 23.2578125 | 2.9 |
| 23.265625 | 1.4 |
| 23.2734375 | 14.8 |
| 23.28125 | 27.5 |
| 23.2890625 | 31.6 |
| 23.296875 | 27.7 |
| 23.3046875 | 20.3 |
| 23.3125 | 21.4 |
| 23.3203125 | 19.9 |
| 23.328125 | 9.4 |
| 23.3359375 | 5.9 |
| 23.34375 | 5.3 |
| 23.3515625 | 6.9 |
| 23.359375 | 18 |
| 23.3671875 | 20.7 |
| 23.375 | 15.7 |
| 23.3828125 | 17.6 |
| 23.390625 | 21 |
| 23.3984375 | 26.1 |
| 23.40625 | 27.5 |
| 23.4140625 | 19.8 |
| 23.421875 | 21.3 |
| 23.4296875 | 30.8 |
| 23.4375 | 29.8 |
| 23.4453125 | 22.2 |
| 23.453125 | 16 |
| 23.4609375 | 11 |
| 23.46875 | 2.5 |
| 23.4765625 | -6.9 |
| 23.484375 | -8.8 |
| 23.4921875 | -14.1 |
| 23.5 | -24.7 |
| 23.5078125 | -21 |
| 23.515625 | -11.9 |
| 23.5234375 | -12.3 |
| 23.53125 | -11.2 |
| 23.5390625 | -5 |
| 23.546875 | -0.7 |
| 23.5546875 | -3.1 |
| 23.5625 | -9.3 |
| 23.5703125 | -6.8 |
| 23.578125 | -1 |
| 23.5859375 | -1.7 |
| 23.59375 | 3.5 |
| 23.6015625 | 12.6 |
| 23.609375 | 13.1 |
| 23.6171875 | 13.1 |
| 23.625 | 12 |
| 23.6328125 | 3.1 |
| 23.640625 | -5 |
| 23.6484375 | -6.2 |
| 23.65625 | 1.7 |
| 23.6640625 | 14.6 |
| 23.671875 | 22.1 |
| 23.6796875 | 28.6 |
| 23.6875 | 38.7 |
| 23.6953125 | 44.1 |
| 23.703125 | 38.7 |
| 23.7109375 | 23.5 |
| 23.71875 | 14.1 |
| 23.7265625 | 16.8 |
| 23.734375 | 18.1 |
| 23.7421875 | 24 |
| 23.75 | 36 |
| 23.7578125 | 39.3 |
| 23.765625 | 47.2 |
| 23.7734375 | 58.6 |
| 23.78125 | 48.6 |
| 23.7890625 | 34.8 |
| 23.796875 | 35 |
| 23.8046875 | 33.9 |
| 23.8125 | 31.9 |
| 23.8203125 | 32.4 |
| 23.828125 | 31.8 |
| 23.8359375 | 36.4 |
| 23.84375 | 39.3 |
| 23.8515625 | 26.9 |
| 23.859375 | 9.4 |
| 23.8671875 | -0.2 |
| 23.875 | -8.8 |
| 23.8828125 | -17.5 |
| 23.890625 | -16.3 |
| 23.8984375 | -15.1 |
| 23.90625 | -22.4 |
| 23.9140625 | -25.6 |
| 23.921875 | -27.5 |
| 23.9296875 | -34.4 |
| 23.9375 | -38.3 |
| 23.9453125 | -42.5 |
| 23.953125 | -44.4 |
| 23.9609375 | -40.3 |
| 23.96875 | -40.3 |
| 23.9765625 | -33.6 |
| 23.984375 | -17.2 |
| 23.9921875 | -15.3 |
| 24.0 | -18.9 |
| 24.0078125 | -12.7 |
| 24.015625 | -10.3 |
| 24.0234375 | -9.6 |
| 24.03125 | -2.3 |
| 24.0390625 | -1.1 |
| 24.046875 | -10.1 |
| 24.0546875 | -16.8 |
| 24.0625 | -13 |
| 24.0703125 | -8.6 |
| 24.078125 | -13.2 |
| 24.0859375 | -16.2 |
| 24.09375 | -11.2 |
| 24.1015625 | -6.8 |
| 24.109375 | -4.6 |
| 24.1171875 | -2.1 |
| 24.125 | 3 |
| 24.1328125 | 11.6 |
| 24.140625 | 17.3 |
| 24.1484375 | 18.6 |
| 24.15625 | 23 |
| 24.1640625 | 30.6 |
| 24.171875 | 37.1 |
| 24.1796875 | 36.9 |
| 24.1875 | 25 |
| 24.1953125 | 17 |
| 24.203125 | 28.9 |
| 24.2109375 | 40.3 |
| 24.21875 | 32.9 |
| 24.2265625 | 23 |
| 24.234375 | 21 |
| 24.2421875 | 21.7 |
| 24.25 | 21.2 |
| 24.2578125 | 13.9 |
| 24.265625 | 4.2 |
| 24.2734375 | -0.6 |
| 24.28125 | -7.3 |
| 24.2890625 | -17.2 |
| 24.296875 | -24.6 |
| 24.3046875 | -26.8 |
| 24.3125 | -22.8 |
| 24.3203125 | -26.2 |
| 24.328125 | -42.1 |
| 24.3359375 | -50.4 |
| 24.34375 | -50.8 |
| 24.3515625 | -52.9 |
| 24.359375 | -50.1 |
| 24.3671875 | -52.9 |
| 24.375 | -59.3 |
| 24.3828125 | -44.7 |
| 24.390625 | -26.6 |
| 24.3984375 | -25.3 |
| 24.40625 | -23 |
| 24.4140625 | -20.1 |
| 24.421875 | -21.1 |
| 24.4296875 | -17.4 |
| 24.4375 | -18.8 |
| 24.4453125 | -20.6 |
| 24.453125 | -15.1 |
| 24.4609375 | -21.1 |
| 24.46875 | -31.2 |
| 24.4765625 | -29.3 |
| 24.484375 | -27.4 |
| 24.4921875 | -26.1 |
| 24.5 | -23.6 |
| 24.5078125 | -26 |
| 24.515625 | -24.8 |
| 24.5234375 | -21.8 |
| 24.53125 | -23.7 |
| 24.5390625 | -21.8 |
| 24.546875 | -17.8 |
| 24.5546875 | -16.5 |
| 24.5625 | -15.1 |
| 24.5703125 | -16.9 |
| 24.578125 | -18.7 |
| 24.5859375 | -15.7 |
| 24.59375 | -11 |
| 24.6015625 | -3.7 |
| 24.609375 | 4.4 |
| 24.6171875 | 10.6 |
| 24.625 | 16.7 |
| 24.6328125 | 19.4 |
| 24.640625 | 19.8 |
| 24.6484375 | 19.3 |
| 24.65625 | 12.8 |
| 24.6640625 | 8.8 |
| 24.671875 | 9.6 |
| 24.6796875 | 0.8 |
| 24.6875 | -12.6 |
| 24.6953125 | -19.1 |
| 24.703125 | -24.7 |
| 24.7109375 | -28.2 |
| 24.71875 | -29.5 |
| 24.7265625 | -34 |
| 24.734375 | -30.6 |
| 24.7421875 | -19.3 |
| 24.75 | -19.1 |
| 24.7578125 | -20 |
| 24.765625 | -7 |
| 24.7734375 | 1.4 |
| 24.78125 | -1.1 |
| 24.7890625 | 2.3 |
| 24.796875 | 8 |
| 24.8046875 | 5.2 |
| 24.8125 | -2.5 |
| 24.8203125 | -10.6 |
| 24.828125 | -16.2 |
| 24.8359375 | -19.9 |
| 24.84375 | -25 |
| 24.8515625 | -28.3 |
| 24.859375 | -30.2 |
| 24.8671875 | -30.9 |
| 24.875 | -23.1 |
| 24.8828125 | -11.5 |
| 24.890625 | -9.8 |
| 24.8984375 | -12.9 |
| 24.90625 | -8.5 |
| 24.9140625 | -3.9 |
| 24.921875 | -5.8 |
| 24.9296875 | -4.1 |
| 24.9375 | -3.4 |
| 24.9453125 | -10.5 |
| 24.953125 | -10.2 |
| 24.9609375 | -8.6 |
| 24.96875 | -17.7 |
| 24.9765625 | -20.2 |
| 24.984375 | -15.7 |
| 24.9921875 | -12.1 |
| 25.0 | -2.2 |
| 25.0078125 | -1.4 |
| 25.015625 | -12.3 |
| 25.0234375 | -12.2 |
| 25.03125 | -8.6 |
| 25.0390625 | -12.2 |
| 25.046875 | -15.4 |
| 25.0546875 | -16.9 |
| 25.0625 | -12 |
| 25.0703125 | -3 |
| 25.078125 | -1.9 |
| 25.0859375 | -0.2 |
| 25.09375 | 9.5 |
| 25.1015625 | 13.5 |
| 25.109375 | 8.6 |
| 25.1171875 | 9 |
| 25.125 | 16.2 |
| 25.1328125 | 19.5 |
| 25.140625 | 19.8 |
| 25.1484375 | 18.8 |
| 25.15625 | 16.4 |
| 25.1640625 | 24.2 |
| 25.171875 | 36.6 |
| 25.1796875 | 35.4 |
| 25.1875 | 32.1 |
| 25.1953125 | 37.8 |
| 25.203125 | 42.7 |
| 25.2109375 | 45 |
| 25.21875 | 46.3 |
| 25.2265625 | 44.9 |
| 25.234375 | 42.9 |
| 25.2421875 | 41.4 |
| 25.25 | 42.3 |
| 25.2578125 | 42 |
| 25.265625 | 37 |
| 25.2734375 | 37.5 |
| 25.28125 | 40.4 |
| 25.2890625 | 31.2 |
| 25.296875 | 23.3 |
| 25.3046875 | 27.9 |
| 25.3125 | 29.2 |
| 25.3203125 | 28.6 |
| 25.328125 | 37 |
| 25.3359375 | 41.4 |
| 25.34375 | 36.8 |
| 25.3515625 | 35.5 |
| 25.359375 | 36.2 |
| 25.3671875 | 30.6 |
| 25.375 | 24.4 |
| 25.3828125 | 31 |
| 25.390625 | 44.2 |
| 25.3984375 | 43.1 |
| 25.40625 | 33.4 |
| 25.4140625 | 30 |
| 25.421875 | 26.8 |
| 25.4296875 | 22.9 |
| 25.4375 | 17.9 |
| 25.4453125 | 12.1 |
| 25.453125 | 18.9 |
| 25.4609375 | 25.2 |
| 25.46875 | 17.6 |
| 25.4765625 | 20.1 |
| 25.484375 | 28.6 |
| 25.4921875 | 24.5 |
| 25.5 | 25.8 |
| 25.5078125 | 32.6 |
| 25.515625 | 28.7 |
| 25.5234375 | 22.4 |
| 25.53125 | 16.5 |
| 25.5390625 | 10.4 |
| 25.546875 | 9.7 |
| 25.5546875 | 5.5 |
| 25.5625 | -4.5 |
| 25.5703125 | -8.2 |
| 25.578125 | -11.1 |
| 25.5859375 | -21.6 |
| 25.59375 | -26.4 |
| 25.6015625 | -19.9 |
| 25.609375 | -14.9 |
| 25.6171875 | -14.8 |
| 25.625 | -16.7 |
| 25.6328125 | -21 |
| 25.640625 | -25.6 |
| 25.6484375 | -28.3 |
| 25.65625 | -26.9 |
| 25.6640625 | -23.6 |
| 25.671875 | -25.5 |
| 25.6796875 | -27.9 |
| 25.6875 | -26.9 |
| 25.6953125 | -27.2 |
| 25.703125 | -25.8 |
| 25.7109375 | -23.1 |
| 25.71875 | -27.8 |
| 25.7265625 | -35.6 |
| 25.734375 | -34.1 |
| 25.7421875 | -28.3 |
| 25.75 | -32 |
| 25.7578125 | -31.6 |
| 25.765625 | -16 |
| 25.7734375 | -8.6 |
| 25.78125 | -7.8 |
| 25.7890625 | 0.6 |
| 25.796875 | -2.8 |
| 25.8046875 | -10.6 |
| 25.8125 | -2.5 |
| 25.8203125 | 1.2 |
| 25.828125 | -2.8 |
| 25.8359375 | -0.2 |
| 25.84375 | 2.9 |
| 25.8515625 | 4.4 |
| 25.859375 | 4.2 |
| 25.8671875 | 3.4 |
| 25.875 | 6.4 |
| 25.8828125 | 3.6 |
| 25.890625 | -4 |
| 25.8984375 | -8.3 |
| 25.90625 | -13.9 |
| 25.9140625 | -15.4 |
| 25.921875 | -8.3 |
| 25.9296875 | -4.1 |
| 25.9375 | -2.7 |
| 25.9453125 | 4.3 |
| 25.953125 | 14.6 |
| 25.9609375 | 19.5 |
| 25.96875 | 18.7 |
| 25.9765625 | 19.6 |
| 25.984375 | 21 |
| 25.9921875 | 16.6 |
| 26.0 | 6 |
| 26.0078125 | -8.2 |
| 26.015625 | -22.6 |
| 26.0234375 | -34.5 |
| 26.03125 | -36.1 |
| 26.0390625 | -28 |
| 26.046875 | -29.1 |
| 26.0546875 | -35.8 |
| 26.0625 | -28 |
| 26.0703125 | -17.9 |
| 26.078125 | -17.3 |
| 26.0859375 | -14.3 |
| 26.09375 | -8 |
| 26.1015625 | -2.2 |
| 26.109375 | 4 |
| 26.1171875 | 8.8 |
| 26.125 | 14.7 |
| 26.1328125 | 18.5 |
| 26.140625 | 16.8 |
| 26.1484375 | 13 |
| 26.15625 | 6.7 |
| 26.1640625 | 4.3 |
| 26.171875 | 4.3 |
| 26.1796875 | -6.8 |
| 26.1875 | -14 |
| 26.1953125 | -10.2 |
| 26.203125 | -14.6 |
| 26.2109375 | -16 |
| 26.21875 | -6.2 |
| 26.2265625 | -3.3 |
| 26.234375 | 1 |
| 26.2421875 | 12.8 |
| 26.25 | 19.9 |
| 26.2578125 | 25.7 |
| 26.265625 | 27.7 |
| 26.2734375 | 23.3 |
| 26.28125 | 21.4 |
| 26.2890625 | 14.8 |
| 26.296875 | 8.4 |
| 26.3046875 | 11.7 |
| 26.3125 | 7.3 |
| 26.3203125 | 0.7 |
| 26.328125 | 6.8 |
| 26.3359375 | 5.1 |
| 26.34375 | -4.4 |
| 26.3515625 | -1.9 |
| 26.359375 | -0.7 |
| 26.3671875 | -6.4 |
| 26.375 | -1.9 |
| 26.3828125 | 6.8 |
| 26.390625 | 9.1 |
| 26.3984375 | 14.8 |
| 26.40625 | 25.6 |
| 26.4140625 | 25.6 |
| 26.421875 | 14 |
| 26.4296875 | 11.5 |
| 26.4375 | 23.3 |
| 26.4453125 | 33.5 |
| 26.453125 | 34.6 |
| 26.4609375 | 29.4 |
| 26.46875 | 24 |
| 26.4765625 | 24 |
| 26.484375 | 27.7 |
| 26.4921875 | 34.8 |
| 26.5 | 44.1 |
| 26.5078125 | 47.5 |
| 26.515625 | 47.3 |
| 26.5234375 | 50.5 |
| 26.53125 | 49.8 |
| 26.5390625 | 38.8 |
| 26.546875 | 27.3 |
| 26.5546875 | 26.6 |
| 26.5625 | 28 |
| 26.5703125 | 20.9 |
| 26.578125 | 16.2 |
| 26.5859375 | 18.2 |
| 26.59375 | 16.5 |
| 26.6015625 | 15.4 |
| 26.609375 | 16.2 |
| 26.6171875 | 8.9 |
| 26.625 | -2.3 |
| 26.6328125 | -10.6 |
| 26.640625 | -17.2 |
| 26.6484375 | -18.7 |
| 26.65625 | -15.3 |
| 26.6640625 | -17.4 |
| 26.671875 | -25.3 |
| 26.6796875 | -25.1 |
| 26.6875 | -22.9 |
| 26.6953125 | -36 |
| 26.703125 | -46 |
| 26.7109375 | -37.8 |
| 26.71875 | -34.4 |
| 26.7265625 | -39.7 |
| 26.734375 | -38.3 |
| 26.7421875 | -39.6 |
| 26.75 | -49 |
| 26.7578125 | -53.6 |
| 26.765625 | -53.4 |
| 26.7734375 | -58.3 |
| 26.78125 | -63.5 |
| 26.7890625 | -58.5 |
| 26.796875 | -52.6 |
| 26.8046875 | -55.5 |
| 26.8125 | -54.9 |
| 26.8203125 | -49.4 |
| 26.828125 | -51.7 |
| 26.8359375 | -59 |
| 26.84375 | -65.6 |
| 26.8515625 | -70.6 |
| 26.859375 | -72.4 |
| 26.8671875 | -76.2 |
| 26.875 | -76.1 |
| 26.8828125 | -62.9 |
| 26.890625 | -56.5 |
| 26.8984375 | -63.1 |
| 26.90625 | -60.5 |
| 26.9140625 | -55.7 |
| 26.921875 | -63 |
| 26.9296875 | -69.8 |
| 26.9375 | -73 |
| 26.9453125 | -75.6 |
| 26.953125 | -75.5 |
| 26.9609375 | -78 |
| 26.96875 | -78.3 |
| 26.9765625 | -74.9 |
| 26.984375 | -75.7 |
| 26.9921875 | -68.7 |
| 27.0 | -54.2 |
| 27.0078125 | -51 |
| 27.015625 | -47.4 |
| 27.0234375 | -32.4 |
| 27.03125 | -20.9 |
| 27.0390625 | -10.8 |
| 27.046875 | 3.7 |
| 27.0546875 | 11 |
| 27.0625 | 13.1 |
| 27.0703125 | 18.9 |
| 27.078125 | 23.5 |
| 27.0859375 | 26.4 |
| 27.09375 | 30.3 |
| 27.1015625 | 30.5 |
| 27.109375 | 33 |
| 27.1171875 | 42.2 |
| 27.125 | 42.6 |
| 27.1328125 | 31.9 |
| 27.140625 | 26.6 |
| 27.1484375 | 27 |
| 27.15625 | 23.4 |
| 27.1640625 | 20.3 |
| 27.171875 | 25.9 |
| 27.1796875 | 38 |
| 27.1875 | 49.4 |
| 27.1953125 | 59.4 |
| 27.203125 | 66.9 |
| 27.2109375 | 66.9 |
| 27.21875 | 59.7 |
| 27.2265625 | 50.9 |
| 27.234375 | 44.5 |
| 27.2421875 | 42.5 |
| 27.25 | 47.1 |
| 27.2578125 | 57.9 |
| 27.265625 | 65.5 |
| 27.2734375 | 62.9 |
| 27.28125 | 54.8 |
| 27.2890625 | 42.7 |
| 27.296875 | 25.7 |
| 27.3046875 | 9.2 |
| 27.3125 | -3.2 |
| 27.3203125 | -7 |
| 27.328125 | -2.2 |
| 27.3359375 | 4.5 |
| 27.34375 | 12.6 |
| 27.3515625 | 19.1 |
| 27.359375 | 17.5 |
| 27.3671875 | 10.4 |
| 27.375 | -1.1 |
| 27.3828125 | -9.8 |
| 27.390625 | -3.1 |
| 27.3984375 | 9.5 |
| 27.40625 | 16.5 |
| 27.4140625 | 23.3 |
| 27.421875 | 32.3 |
| 27.4296875 | 44.1 |
| 27.4375 | 54 |
| 27.4453125 | 50.8 |
| 27.453125 | 41.2 |
| 27.4609375 | 33.5 |
| 27.46875 | 24.9 |
| 27.4765625 | 21.3 |
| 27.484375 | 23.6 |
| 27.4921875 | 20.9 |
| 27.5 | 18.5 |
| 27.5078125 | 20.5 |
| 27.515625 | 14.8 |
| 27.5234375 | 5.2 |
| 27.53125 | 1.3 |
| 27.5390625 | -2 |
| 27.546875 | 0.3 |
| 27.5546875 | 9.6 |
| 27.5625 | 12.1 |
| 27.5703125 | 15.9 |
| 27.578125 | 29.6 |
| 27.5859375 | 35.5 |
| 27.59375 | 34.2 |
| 27.6015625 | 36.6 |
| 27.609375 | 32.2 |
| 27.6171875 | 20.6 |
| 27.625 | 10.6 |
| 27.6328125 | 1.3 |
| 27.640625 | 0.9 |
| 27.6484375 | 12.9 |
| 27.65625 | 24.1 |
| 27.6640625 | 31.9 |
| 27.671875 | 36.8 |
| 27.6796875 | 33.3 |
| 27.6875 | 29.6 |
| 27.6953125 | 31.7 |
| 27.703125 | 28.8 |
| 27.7109375 | 19.6 |
| 27.71875 | 13.1 |
| 27.7265625 | 9.8 |
| 27.734375 | 9.9 |
| 27.7421875 | 9.3 |
| 27.75 | -2.6 |
| 27.7578125 | -23.1 |
| 27.765625 | -42.4 |
| 27.7734375 | -54.6 |
| 27.78125 | -55.9 |
| 27.7890625 | -52.7 |
| 27.796875 | -46.5 |
| 27.8046875 | -29.3 |
| 27.8125 | -10.8 |
| 27.8203125 | 3.7 |
| 27.828125 | 19.3 |
| 27.8359375 | 20.6 |
| 27.84375 | 9.1 |
| 27.8515625 | 9.8 |
| 27.859375 | 14.1 |
| 27.8671875 | 11.3 |
| 27.875 | 18.1 |
| 27.8828125 | 28.2 |
| 27.890625 | 28.8 |
| 27.8984375 | 29.8 |
| 27.90625 | 30.9 |
| 27.9140625 | 26.4 |
| 27.921875 | 20.4 |
| 27.9296875 | 10.6 |
| 27.9375 | 1.1 |
| 27.9453125 | 0.5 |
| 27.953125 | 0.6 |
| 27.9609375 | -3.6 |
| 27.96875 | -6.2 |
| 27.9765625 | -8.3 |
| 27.984375 | -8.2 |
| 27.9921875 | -5.9 |
| 28.0 | -10.4 |
| 28.0078125 | -18.2 |
| 28.015625 | -21.5 |
| 28.0234375 | -22.1 |
| 28.03125 | -19 |
| 28.0390625 | -17.5 |
| 28.046875 | -19 |
| 28.0546875 | -8.2 |
| 28.0625 | 6.8 |
| 28.0703125 | 5.7 |
| 28.078125 | 0.5 |
| 28.0859375 | 0.5 |
| 28.09375 | -1.8 |
| 28.1015625 | -5 |
| 28.109375 | -7.8 |
| 28.1171875 | -9.3 |
| 28.125 | -5.6 |
| 28.1328125 | -3.5 |
| 28.140625 | -6.8 |
| 28.1484375 | -5.4 |
| 28.15625 | 1.7 |
| 28.1640625 | 4.8 |
| 28.171875 | 9.2 |
| 28.1796875 | 20.6 |
| 28.1875 | 22.1 |
| 28.1953125 | 13.5 |
| 28.203125 | 17.4 |
| 28.2109375 | 24.7 |
| 28.21875 | 21.7 |
| 28.2265625 | 22.6 |
| 28.234375 | 24.7 |
| 28.2421875 | 20.9 |
| 28.25 | 23.8 |
| 28.2578125 | 25.4 |
| 28.265625 | 14 |
| 28.2734375 | 5.8 |
| 28.28125 | 1.1 |
| 28.2890625 | -9.6 |
| 28.296875 | -12.2 |
| 28.3046875 | -7.2 |
| 28.3125 | -8.5 |
| 28.3203125 | -5.5 |
| 28.328125 | 8.1 |
| 28.3359375 | 21.5 |
| 28.34375 | 33.5 |
| 28.3515625 | 40.5 |
| 28.359375 | 36.2 |
| 28.3671875 | 29.2 |
| 28.375 | 27.2 |
| 28.3828125 | 28.2 |
| 28.390625 | 27.3 |
| 28.3984375 | 25.7 |
| 28.40625 | 31.4 |
| 28.4140625 | 36.7 |
| 28.421875 | 29.1 |
| 28.4296875 | 17.4 |
| 28.4375 | 9.6 |
| 28.4453125 | 0.8 |
| 28.453125 | -10.4 |
| 28.4609375 | -16.9 |
| 28.46875 | -13.3 |
| 28.4765625 | -6.8 |
| 28.484375 | -0.2 |
| 28.4921875 | 11.3 |
| 28.5 | 14.1 |
| 28.5078125 | 1.7 |
| 28.515625 | -5.9 |
| 28.5234375 | -6.9 |
| 28.53125 | -13.6 |
| 28.5390625 | -18.9 |
| 28.546875 | -16.9 |
| 28.5546875 | -11.9 |
| 28.5625 | -3.3 |
| 28.5703125 | 10 |
| 28.578125 | 19.8 |
| 28.5859375 | 18.9 |
| 28.59375 | 13.6 |
| 28.6015625 | 10.9 |
| 28.609375 | 10.2 |
| 28.6171875 | 11.6 |
| 28.625 | 9.1 |
| 28.6328125 | 4.1 |
| 28.640625 | 7.1 |
| 28.6484375 | 8.2 |
| 28.65625 | 0 |
| 28.6640625 | -5.2 |
| 28.671875 | -7.4 |
| 28.6796875 | -6.6 |
| 28.6875 | 2.1 |
| 28.6953125 | 7.2 |
| 28.703125 | 7.5 |
| 28.7109375 | 12 |
| 28.71875 | 14.2 |
| 28.7265625 | 10.9 |
| 28.734375 | 5.2 |
| 28.7421875 | -3.1 |
| 28.75 | -9.7 |
| 28.7578125 | -12.1 |
| 28.765625 | -10.6 |
| 28.7734375 | -9 |
| 28.78125 | -12 |
| 28.7890625 | -15.1 |
| 28.796875 | -20.3 |
| 28.8046875 | -33.9 |
| 28.8125 | -46.7 |
| 28.8203125 | -55.7 |
| 28.828125 | -65.5 |
| 28.8359375 | -68.8 |
| 28.84375 | -65 |
| 28.8515625 | -61.6 |
| 28.859375 | -54 |
| 28.8671875 | -41.6 |
| 28.875 | -34.9 |
| 28.8828125 | -35.7 |
| 28.890625 | -41.5 |
| 28.8984375 | -49.3 |
| 28.90625 | -53 |
| 28.9140625 | -55.4 |
| 28.921875 | -58.3 |
| 28.9296875 | -50.7 |
| 28.9375 | -36.3 |
| 28.9453125 | -30.7 |
| 28.953125 | -30.3 |
| 28.9609375 | -29.6 |
| 28.96875 | -33.3 |
| 28.9765625 | -35.5 |
| 28.984375 | -31.2 |
| 28.9921875 | -29.5 |
| 29.0 | -29.8 |
| 29.0078125 | -21.3 |
| 29.015625 | -10.7 |
| 29.0234375 | -7.7 |
| 29.03125 | -8 |
| 29.0390625 | -7.1 |
| 29.046875 | -5.5 |
| 29.0546875 | -9.6 |
| 29.0625 | -19.5 |
| 29.0703125 | -19.8 |
| 29.078125 | -13.8 |
| 29.0859375 | -14.1 |
| 29.09375 | -9.9 |
| 29.1015625 | -1.1 |
| 29.109375 | 1.8 |
| 29.1171875 | 5.3 |
| 29.125 | 3.6 |
| 29.1328125 | -8.8 |
| 29.140625 | -15.9 |
| 29.1484375 | -14.7 |
| 29.15625 | -11.3 |
| 29.1640625 | -0.4 |
| 29.171875 | 15.1 |
| 29.1796875 | 23.7 |
| 29.1875 | 22.9 |
| 29.1953125 | 14.5 |
| 29.203125 | 2.7 |
| 29.2109375 | -1.7 |
| 29.21875 | 1.9 |
| 29.2265625 | 2.7 |
| 29.234375 | 7 |
| 29.2421875 | 21.9 |
| 29.25 | 33.5 |
| 29.2578125 | 38.5 |
| 29.265625 | 45 |
| 29.2734375 | 47.6 |
| 29.28125 | 40.3 |
| 29.2890625 | 30.6 |
| 29.296875 | 26.9 |
| 29.3046875 | 25.9 |
| 29.3125 | 21.1 |
| 29.3203125 | 14.2 |
| 29.328125 | 9.3 |
| 29.3359375 | 8.2 |
| 29.34375 | 6.4 |
| 29.3515625 | -0.2 |
| 29.359375 | -5.9 |
| 29.3671875 | -9.1 |
| 29.375 | -11 |
| 29.3828125 | -12.9 |
| 29.390625 | -18 |
| 29.3984375 | -17.5 |
| 29.40625 | -11.8 |
| 29.4140625 | -14.8 |
| 29.421875 | -19.1 |
| 29.4296875 | -19.3 |
| 29.4375 | -18.9 |
| 29.4453125 | -13.6 |
| 29.453125 | -12.2 |
| 29.4609375 | -18.4 |
| 29.46875 | -24.8 |
| 29.4765625 | -36.1 |
| 29.484375 | -44.3 |
| 29.4921875 | -47.9 |
| 29.5 | -57.5 |
| 29.5078125 | -58.5 |
| 29.515625 | -50.5 |
| 29.5234375 | -50.2 |
| 29.53125 | -53.2 |
| 29.5390625 | -56 |
| 29.546875 | -52 |
| 29.5546875 | -41.3 |
| 29.5625 | -39.7 |
| 29.5703125 | -37.1 |
| 29.578125 | -28.2 |
| 29.5859375 | -27.3 |
| 29.59375 | -21.2 |
| 29.6015625 | -9.3 |
| 29.609375 | -9.2 |
| 29.6171875 | -9.7 |
| 29.625 | -6.4 |
| 29.6328125 | -7.5 |
| 29.640625 | -8.3 |
| 29.6484375 | -12.7 |
| 29.65625 | -20.6 |
| 29.6640625 | -20 |
| 29.671875 | -20.8 |
| 29.6796875 | -31.5 |
| 29.6875 | -37.4 |
| 29.6953125 | -36.3 |
| 29.703125 | -35.8 |
| 29.7109375 | -32.8 |
| 29.71875 | -33.4 |
| 29.7265625 | -42.4 |
| 29.734375 | -47.5 |
| 29.7421875 | -45.7 |
| 29.75 | -45.6 |
| 29.7578125 | -47.7 |
| 29.765625 | -47.4 |
| 29.7734375 | -41.6 |
| 29.78125 | -33.7 |
| 29.7890625 | -28.8 |
| 29.796875 | -25.7 |
| 29.8046875 | -22.4 |
| 29.8125 | -16 |
| 29.8203125 | -7.3 |
| 29.828125 | -1.7 |
| 29.8359375 | 8.3 |
| 29.84375 | 25 |
| 29.8515625 | 27.3 |
| 29.859375 | 13.8 |
| 29.8671875 | 8.4 |
| 29.875 | 13 |
| 29.8828125 | 11.8 |
| 29.890625 | 10.9 |
| 29.8984375 | 21.3 |
| 29.90625 | 26.5 |
| 29.9140625 | 18.5 |
| 29.921875 | 16.6 |
| 29.9296875 | 22.7 |
| 29.9375 | 26.2 |
| 29.9453125 | 28.7 |
| 29.953125 | 30 |
| 29.9609375 | 31 |
| 29.96875 | 34.3 |
| 29.9765625 | 36 |
| 29.984375 | 38 |
| 29.9921875 | 41 |
| 30.0 | 38.2 |
| 30.0078125 | 30.1 |
| 30.015625 | 19.3 |
| 30.0234375 | 11.4 |
| 30.03125 | 14.2 |
| 30.0390625 | 20 |
| 30.046875 | 24.1 |
| 30.0546875 | 34.3 |
| 30.0625 | 44.9 |
| 30.0703125 | 45.4 |
| 30.078125 | 40.9 |
| 30.0859375 | 38.7 |
| 30.09375 | 38.8 |
| 30.1015625 | 39.3 |
| 30.109375 | 41.1 |
| 30.1171875 | 43.5 |
| 30.125 | 44.4 |
| 30.1328125 | 49.2 |
| 30.140625 | 56.2 |
| 30.1484375 | 57.9 |
| 30.15625 | 63.9 |
| 30.1640625 | 70 |
| 30.171875 | 65.2 |
| 30.1796875 | 67.2 |
| 30.1875 | 73.1 |
| 30.1953125 | 64.1 |
| 30.203125 | 61.3 |
| 30.2109375 | 71.6 |
| 30.21875 | 74.4 |
| 30.2265625 | 75.2 |
| 30.234375 | 78.5 |
| 30.2421875 | 73.4 |
| 30.25 | 59.3 |
| 30.2578125 | 42.8 |
| 30.265625 | 34.8 |
| 30.2734375 | 36.5 |
| 30.28125 | 38.3 |
| 30.2890625 | 39.1 |
| 30.296875 | 37.1 |
| 30.3046875 | 31.2 |
| 30.3125 | 24.6 |
| 30.3203125 | 17.7 |
| 30.328125 | 16.2 |
| 30.3359375 | 16.3 |
| 30.34375 | 8 |
| 30.3515625 | 3.9 |
| 30.359375 | 9.2 |
| 30.3671875 | 9 |
| 30.375 | 5.9 |
| 30.3828125 | 9.8 |
| 30.390625 | 16.7 |
| 30.3984375 | 20 |
| 30.40625 | 20.5 |
| 30.4140625 | 23.8 |
| 30.421875 | 27 |
| 30.4296875 | 25.9 |
| 30.4375 | 29.8 |
| 30.4453125 | 34.7 |
| 30.453125 | 26.7 |
| 30.4609375 | 16.8 |
| 30.46875 | 16.4 |
| 30.4765625 | 13.8 |
| 30.484375 | 5 |
| 30.4921875 | -5.6 |
| 30.5 | -16.4 |
| 30.5078125 | -21 |
| 30.515625 | -21.1 |
| 30.5234375 | -22.7 |
| 30.53125 | -24 |
| 30.5390625 | -27.7 |
| 30.546875 | -33.9 |
| 30.5546875 | -36.2 |
| 30.5625 | -37.2 |
| 30.5703125 | -39 |
| 30.578125 | -37.3 |
| 30.5859375 | -32.3 |
| 30.59375 | -23.9 |
| 30.6015625 | -11.8 |
| 30.609375 | -5.8 |
| 30.6171875 | -11.5 |
| 30.625 | -13.8 |
| 30.6328125 | -4.3 |
| 30.640625 | 0.1 |
| 30.6484375 | -6 |
| 30.65625 | -9.9 |
| 30.6640625 | -7.3 |
| 30.671875 | -0.2 |
| 30.6796875 | 4.8 |
| 30.6875 | 4.9 |
| 30.6953125 | 6.6 |
| 30.703125 | 6.9 |
| 30.7109375 | 4.3 |
| 30.71875 | 1 |
| 30.7265625 | -7.3 |
| 30.734375 | -12.8 |
| 30.7421875 | -11.1 |
| 30.75 | -8.7 |
| 30.7578125 | -3.1 |
| 30.765625 | -2.5 |
| 30.7734375 | -6.7 |
| 30.78125 | -4.5 |
| 30.7890625 | -11.6 |
| 30.796875 | -20.6 |
| 30.8046875 | -10.6 |
| 30.8125 | -8.6 |
| 30.8203125 | -15.3 |
| 30.828125 | -7.6 |
| 30.8359375 | -7.1 |
| 30.84375 | -12.4 |
| 30.8515625 | -7.2 |
| 30.859375 | -10.3 |
| 30.8671875 | -15.4 |
| 30.875 | -15.7 |
| 30.8828125 | -22.8 |
| 30.890625 | -17.2 |
| 30.8984375 | -8.7 |
| 30.90625 | -17.7 |
| 30.9140625 | -10.1 |
| 30.921875 | 4.4 |
| 30.9296875 | -4.1 |
| 30.9375 | -5.1 |
| 30.9453125 | -0.2 |
| 30.953125 | -9.5 |
| 30.9609375 | -13.8 |
| 30.96875 | -15.1 |
| 30.9765625 | -21.8 |
| 30.984375 | -29.1 |
| 30.9921875 | -37.3 |
| 31.0 | -29.1 |
| 31.0078125 | -11.1 |
| 31.015625 | -7.8 |
| 31.0234375 | -10.8 |
| 31.03125 | -15 |
| 31.0390625 | -14.5 |
| 31.046875 | -4.4 |
| 31.0546875 | -5.9 |
| 31.0625 | -8.1 |
| 31.0703125 | -1.6 |
| 31.078125 | -8.7 |
| 31.0859375 | -12.4 |
| 31.09375 | -4.9 |
| 31.1015625 | -7.9 |
| 31.109375 | -9.2 |
| 31.1171875 | -9.9 |
| 31.125 | -16.3 |
| 31.1328125 | -10.5 |
| 31.140625 | -5.5 |
| 31.1484375 | -8.6 |
| 31.15625 | -7.2 |
| 31.1640625 | -12.5 |
| 31.171875 | -22 |
| 31.1796875 | -23.9 |
| 31.1875 | -24.4 |
| 31.1953125 | -22.6 |
| 31.203125 | -19.9 |
| 31.2109375 | -14.7 |
| 31.21875 | -1.1 |
| 31.2265625 | 4.4 |
| 31.234375 | 0.7 |
| 31.2421875 | 2.1 |
| 31.25 | -1.5 |
| 31.2578125 | -9 |
| 31.265625 | -6.2 |
| 31.2734375 | -4.2 |
| 31.28125 | -13.7 |
| 31.2890625 | -18.9 |
| 31.296875 | -6.8 |
| 31.3046875 | 8.2 |
| 31.3125 | 8 |
| 31.3203125 | 3.4 |
| 31.328125 | 7.2 |
| 31.3359375 | 9.4 |
| 31.34375 | 5.4 |
| 31.3515625 | 0.3 |
| 31.359375 | -7.9 |
| 31.3671875 | -11.3 |
| 31.375 | -0.7 |
| 31.3828125 | 6.9 |
| 31.390625 | 0.4 |
| 31.3984375 | -1.7 |
| 31.40625 | 6.1 |
| 31.4140625 | 8.9 |
| 31.421875 | 7.3 |
| 31.4296875 | 6.6 |
| 31.4375 | 4.4 |
| 31.4453125 | 3.8 |
| 31.453125 | 4.4 |
| 31.4609375 | 0.4 |
| 31.46875 | -4.8 |
| 31.4765625 | -8.9 |
| 31.484375 | -10.8 |
| 31.4921875 | -9.3 |
| 31.5 | -15.7 |
| 31.5078125 | -27.5 |
| 31.515625 | -28.4 |
| 31.5234375 | -21.6 |
| 31.53125 | -15.9 |
| 31.5390625 | -15.1 |
| 31.546875 | -18.2 |
| 31.5546875 | -14.1 |
| 31.5625 | -7.5 |
| 31.5703125 | -6.5 |
| 31.578125 | -3.5 |
| 31.5859375 | -5.3 |
| 31.59375 | -6.7 |
| 31.6015625 | 10 |
| 31.609375 | 25.9 |
| 31.6171875 | 32.6 |
| 31.625 | 44.6 |
| 31.6328125 | 52.9 |
| 31.640625 | 54.7 |
| 31.6484375 | 57.3 |
| 31.65625 | 57.9 |
| 31.6640625 | 57.6 |
| 31.671875 | 51.9 |
| 31.6796875 | 44.1 |
| 31.6875 | 44.2 |
| 31.6953125 | 39.5 |
| 31.703125 | 31.4 |
| 31.7109375 | 35.1 |
| 31.71875 | 36.3 |
| 31.7265625 | 23.7 |
| 31.734375 | 8.5 |
| 31.7421875 | -1.4 |
| 31.75 | -4.3 |
| 31.7578125 | -2.8 |
| 31.765625 | 0.5 |
| 31.7734375 | 6 |
| 31.78125 | 15.5 |
| 31.7890625 | 29.7 |
| 31.796875 | 35.2 |
| 31.8046875 | 27.4 |
| 31.8125 | 25.8 |
| 31.8203125 | 30 |
| 31.828125 | 27.8 |
| 31.8359375 | 26.2 |
| 31.84375 | 21 |
| 31.8515625 | 9.9 |
| 31.859375 | 10.9 |
| 31.8671875 | 19.8 |
| 31.875 | 20.3 |
| 31.8828125 | 19.4 |
| 31.890625 | 21.6 |
| 31.8984375 | 17.9 |
| 31.90625 | 8.3 |
| 31.9140625 | 0.8 |
| 31.921875 | -3.2 |
| 31.9296875 | -0.9 |
| 31.9375 | 10.5 |
| 31.9453125 | 22.3 |
| 31.953125 | 28.3 |
| 31.9609375 | 30.1 |
| 31.96875 | 26.2 |
| 31.9765625 | 21 |
| 31.984375 | 16.3 |
| 31.9921875 | 7.3 |